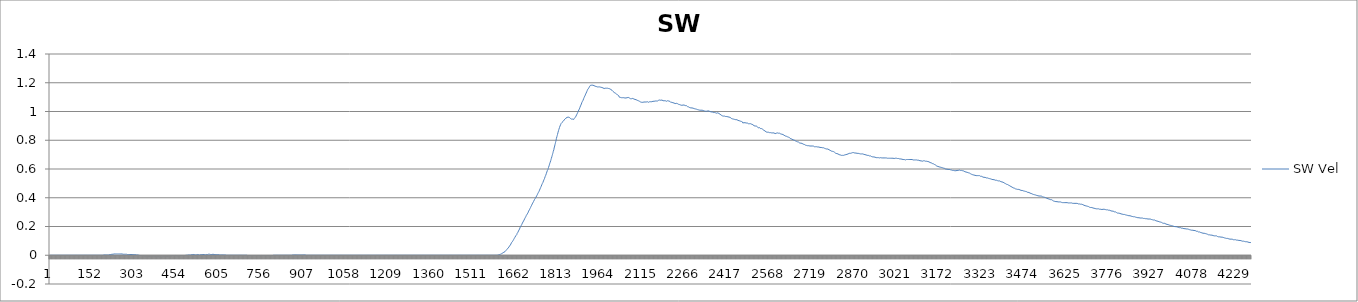
| Category | SW Vel |
|---|---|
| 0 | 0 |
| 1 | 0 |
| 2 | 0 |
| 3 | 0 |
| 4 | 0 |
| 5 | 0 |
| 6 | 0 |
| 7 | 0 |
| 8 | 0 |
| 9 | 0 |
| 10 | 0 |
| 11 | 0 |
| 12 | 0 |
| 13 | 0 |
| 14 | 0 |
| 15 | 0 |
| 16 | 0 |
| 17 | 0 |
| 18 | 0 |
| 19 | 0 |
| 20 | 0 |
| 21 | 0 |
| 22 | 0 |
| 23 | 0 |
| 24 | 0 |
| 25 | 0 |
| 26 | 0 |
| 27 | 0 |
| 28 | 0 |
| 29 | 0 |
| 30 | 0 |
| 31 | 0 |
| 32 | 0 |
| 33 | 0 |
| 34 | 0 |
| 35 | 0 |
| 36 | 0 |
| 37 | 0 |
| 38 | 0 |
| 39 | 0 |
| 40 | 0 |
| 41 | 0 |
| 42 | 0 |
| 43 | 0 |
| 44 | 0 |
| 45 | 0 |
| 46 | 0 |
| 47 | 0 |
| 48 | 0 |
| 49 | 0 |
| 50 | 0 |
| 51 | 0 |
| 52 | 0 |
| 53 | 0 |
| 54 | 0 |
| 55 | 0 |
| 56 | 0 |
| 57 | 0 |
| 58 | 0 |
| 59 | 0 |
| 60 | 0 |
| 61 | 0 |
| 62 | 0 |
| 63 | 0 |
| 64 | 0 |
| 65 | 0 |
| 66 | 0 |
| 67 | 0 |
| 68 | 0 |
| 69 | 0 |
| 70 | 0 |
| 71 | 0 |
| 72 | 0 |
| 73 | 0 |
| 74 | 0 |
| 75 | 0 |
| 76 | 0 |
| 77 | 0 |
| 78 | 0 |
| 79 | 0 |
| 80 | 0 |
| 81 | 0 |
| 82 | 0 |
| 83 | 0 |
| 84 | 0 |
| 85 | 0 |
| 86 | 0 |
| 87 | 0 |
| 88 | 0 |
| 89 | 0 |
| 90 | 0 |
| 91 | 0 |
| 92 | 0 |
| 93 | 0 |
| 94 | 0 |
| 95 | 0 |
| 96 | 0 |
| 97 | 0 |
| 98 | 0 |
| 99 | 0 |
| 100 | 0 |
| 101 | 0 |
| 102 | 0 |
| 103 | 0 |
| 104 | 0 |
| 105 | 0 |
| 106 | 0 |
| 107 | 0 |
| 108 | 0 |
| 109 | 0 |
| 110 | 0 |
| 111 | 0 |
| 112 | 0 |
| 113 | 0 |
| 114 | 0 |
| 115 | 0 |
| 116 | 0 |
| 117 | 0 |
| 118 | 0 |
| 119 | 0 |
| 120 | 0 |
| 121 | 0 |
| 122 | 0 |
| 123 | 0 |
| 124 | 0 |
| 125 | 0 |
| 126 | 0 |
| 127 | 0 |
| 128 | 0 |
| 129 | 0 |
| 130 | 0 |
| 131 | 0 |
| 132 | 0 |
| 133 | 0 |
| 134 | 0 |
| 135 | 0 |
| 136 | 0 |
| 137 | 0 |
| 138 | 0 |
| 139 | 0 |
| 140 | 0 |
| 141 | 0 |
| 142 | 0 |
| 143 | 0 |
| 144 | 0 |
| 145 | 0 |
| 146 | 0 |
| 147 | 0 |
| 148 | 0 |
| 149 | 0 |
| 150 | 0 |
| 151 | 0 |
| 152 | 0 |
| 153 | 0 |
| 154 | 0 |
| 155 | 0 |
| 156 | 0 |
| 157 | 0 |
| 158 | 0 |
| 159 | 0 |
| 160 | 0 |
| 161 | 0 |
| 162 | 0 |
| 163 | 0 |
| 164 | 0 |
| 165 | 0 |
| 166 | 0 |
| 167 | 0 |
| 168 | 0 |
| 169 | 0 |
| 170 | 0 |
| 171 | 0 |
| 172 | 0 |
| 173 | 0 |
| 174 | 0 |
| 175 | 0 |
| 176 | 0 |
| 177 | 0 |
| 178 | 0 |
| 179 | 0 |
| 180 | 0 |
| 181 | 0 |
| 182 | 0 |
| 183 | 0 |
| 184 | 0 |
| 185 | 0 |
| 186 | 0 |
| 187 | 0 |
| 188 | 0 |
| 189 | 0.002 |
| 190 | 0.002 |
| 191 | 0.002 |
| 192 | 0.002 |
| 193 | 0.002 |
| 194 | 0.002 |
| 195 | 0.002 |
| 196 | 0.002 |
| 197 | 0.002 |
| 198 | 0.002 |
| 199 | 0.002 |
| 200 | 0.002 |
| 201 | 0.002 |
| 202 | 0.002 |
| 203 | 0.002 |
| 204 | 0.002 |
| 205 | 0.002 |
| 206 | 0.002 |
| 207 | 0.002 |
| 208 | 0.002 |
| 209 | 0.005 |
| 210 | 0.005 |
| 211 | 0.005 |
| 212 | 0.005 |
| 213 | 0.005 |
| 214 | 0.005 |
| 215 | 0.005 |
| 216 | 0.005 |
| 217 | 0.005 |
| 218 | 0.007 |
| 219 | 0.007 |
| 220 | 0.007 |
| 221 | 0.007 |
| 222 | 0.007 |
| 223 | 0.007 |
| 224 | 0.007 |
| 225 | 0.007 |
| 226 | 0.007 |
| 227 | 0.009 |
| 228 | 0.009 |
| 229 | 0.009 |
| 230 | 0.009 |
| 231 | 0.009 |
| 232 | 0.009 |
| 233 | 0.009 |
| 234 | 0.009 |
| 235 | 0.009 |
| 236 | 0.009 |
| 237 | 0.007 |
| 238 | 0.007 |
| 239 | 0.009 |
| 240 | 0.009 |
| 241 | 0.009 |
| 242 | 0.009 |
| 243 | 0.009 |
| 244 | 0.009 |
| 245 | 0.009 |
| 246 | 0.009 |
| 247 | 0.009 |
| 248 | 0.009 |
| 249 | 0.009 |
| 250 | 0.009 |
| 251 | 0.009 |
| 252 | 0.009 |
| 253 | 0.009 |
| 254 | 0.009 |
| 255 | 0.009 |
| 256 | 0.009 |
| 257 | 0.007 |
| 258 | 0.007 |
| 259 | 0.007 |
| 260 | 0.007 |
| 261 | 0.007 |
| 262 | 0.007 |
| 263 | 0.007 |
| 264 | 0.007 |
| 265 | 0.007 |
| 266 | 0.007 |
| 267 | 0.007 |
| 268 | 0.007 |
| 269 | 0.007 |
| 270 | 0.007 |
| 271 | 0.007 |
| 272 | 0.007 |
| 273 | 0.007 |
| 274 | 0.007 |
| 275 | 0.005 |
| 276 | 0.005 |
| 277 | 0.005 |
| 278 | 0.005 |
| 279 | 0.005 |
| 280 | 0.005 |
| 281 | 0.005 |
| 282 | 0.005 |
| 283 | 0.005 |
| 284 | 0.005 |
| 285 | 0.005 |
| 286 | 0.005 |
| 287 | 0.005 |
| 288 | 0.005 |
| 289 | 0.005 |
| 290 | 0.005 |
| 291 | 0.005 |
| 292 | 0.005 |
| 293 | 0.005 |
| 294 | 0.005 |
| 295 | 0.005 |
| 296 | 0.005 |
| 297 | 0.005 |
| 298 | 0.005 |
| 299 | 0.005 |
| 300 | 0.005 |
| 301 | 0.005 |
| 302 | 0.005 |
| 303 | 0.005 |
| 304 | 0.005 |
| 305 | 0.005 |
| 306 | 0.005 |
| 307 | 0.002 |
| 308 | 0.002 |
| 309 | 0.002 |
| 310 | 0.002 |
| 311 | 0.002 |
| 312 | 0.002 |
| 313 | 0.002 |
| 314 | 0 |
| 315 | 0 |
| 316 | 0 |
| 317 | 0 |
| 318 | 0 |
| 319 | -0.002 |
| 320 | -0.002 |
| 321 | -0.002 |
| 322 | -0.002 |
| 323 | -0.002 |
| 324 | -0.002 |
| 325 | -0.002 |
| 326 | -0.002 |
| 327 | -0.002 |
| 328 | -0.002 |
| 329 | -0.002 |
| 330 | -0.002 |
| 331 | -0.002 |
| 332 | -0.002 |
| 333 | -0.005 |
| 334 | -0.005 |
| 335 | -0.007 |
| 336 | -0.007 |
| 337 | -0.007 |
| 338 | -0.007 |
| 339 | -0.007 |
| 340 | -0.007 |
| 341 | -0.007 |
| 342 | -0.007 |
| 343 | -0.007 |
| 344 | -0.007 |
| 345 | -0.007 |
| 346 | -0.007 |
| 347 | -0.007 |
| 348 | -0.007 |
| 349 | -0.007 |
| 350 | -0.009 |
| 351 | -0.009 |
| 352 | -0.009 |
| 353 | -0.009 |
| 354 | -0.009 |
| 355 | -0.007 |
| 356 | -0.007 |
| 357 | -0.007 |
| 358 | -0.007 |
| 359 | -0.007 |
| 360 | -0.007 |
| 361 | -0.007 |
| 362 | -0.007 |
| 363 | -0.007 |
| 364 | -0.009 |
| 365 | -0.009 |
| 366 | -0.009 |
| 367 | -0.007 |
| 368 | -0.007 |
| 369 | -0.007 |
| 370 | -0.007 |
| 371 | -0.007 |
| 372 | -0.009 |
| 373 | -0.009 |
| 374 | -0.009 |
| 375 | -0.009 |
| 376 | -0.009 |
| 377 | -0.009 |
| 378 | -0.009 |
| 379 | -0.011 |
| 380 | -0.011 |
| 381 | -0.009 |
| 382 | -0.009 |
| 383 | -0.009 |
| 384 | -0.009 |
| 385 | -0.009 |
| 386 | -0.011 |
| 387 | -0.011 |
| 388 | -0.011 |
| 389 | -0.011 |
| 390 | -0.011 |
| 391 | -0.011 |
| 392 | -0.011 |
| 393 | -0.011 |
| 394 | -0.014 |
| 395 | -0.014 |
| 396 | -0.014 |
| 397 | -0.014 |
| 398 | -0.011 |
| 399 | -0.011 |
| 400 | -0.011 |
| 401 | -0.011 |
| 402 | -0.009 |
| 403 | -0.009 |
| 404 | -0.009 |
| 405 | -0.009 |
| 406 | -0.009 |
| 407 | -0.009 |
| 408 | -0.009 |
| 409 | -0.009 |
| 410 | -0.009 |
| 411 | -0.009 |
| 412 | -0.007 |
| 413 | -0.007 |
| 414 | -0.009 |
| 415 | -0.009 |
| 416 | -0.009 |
| 417 | -0.009 |
| 418 | -0.009 |
| 419 | -0.009 |
| 420 | -0.007 |
| 421 | -0.007 |
| 422 | -0.007 |
| 423 | -0.007 |
| 424 | -0.007 |
| 425 | -0.007 |
| 426 | -0.007 |
| 427 | -0.005 |
| 428 | -0.005 |
| 429 | -0.005 |
| 430 | -0.005 |
| 431 | -0.005 |
| 432 | -0.005 |
| 433 | -0.005 |
| 434 | -0.002 |
| 435 | -0.002 |
| 436 | -0.002 |
| 437 | -0.002 |
| 438 | -0.002 |
| 439 | -0.002 |
| 440 | -0.002 |
| 441 | -0.002 |
| 442 | -0.002 |
| 443 | -0.002 |
| 444 | -0.002 |
| 445 | -0.002 |
| 446 | -0.002 |
| 447 | -0.002 |
| 448 | -0.002 |
| 449 | -0.002 |
| 450 | -0.005 |
| 451 | -0.005 |
| 452 | -0.005 |
| 453 | -0.005 |
| 454 | -0.005 |
| 455 | -0.005 |
| 456 | -0.005 |
| 457 | -0.005 |
| 458 | -0.005 |
| 459 | -0.005 |
| 460 | -0.005 |
| 461 | -0.005 |
| 462 | -0.002 |
| 463 | -0.002 |
| 464 | -0.002 |
| 465 | -0.002 |
| 466 | -0.002 |
| 467 | -0.002 |
| 468 | -0.002 |
| 469 | -0.002 |
| 470 | -0.002 |
| 471 | -0.002 |
| 472 | -0.002 |
| 473 | -0.002 |
| 474 | -0.002 |
| 475 | -0.002 |
| 476 | -0.002 |
| 477 | -0.002 |
| 478 | -0.002 |
| 479 | -0.002 |
| 480 | -0.002 |
| 481 | -0.002 |
| 482 | -0.002 |
| 483 | -0.002 |
| 484 | 0 |
| 485 | 0 |
| 486 | 0 |
| 487 | 0 |
| 488 | 0 |
| 489 | 0 |
| 490 | 0.002 |
| 491 | 0.002 |
| 492 | 0.002 |
| 493 | 0.002 |
| 494 | 0.002 |
| 495 | 0.002 |
| 496 | 0.002 |
| 497 | 0.002 |
| 498 | 0.002 |
| 499 | 0.002 |
| 500 | 0.002 |
| 501 | 0.002 |
| 502 | 0.002 |
| 503 | 0.005 |
| 504 | 0.005 |
| 505 | 0.005 |
| 506 | 0.005 |
| 507 | 0.005 |
| 508 | 0.005 |
| 509 | 0.005 |
| 510 | 0.005 |
| 511 | 0.005 |
| 512 | 0.005 |
| 513 | 0.005 |
| 514 | 0.002 |
| 515 | 0.002 |
| 516 | 0.002 |
| 517 | 0.002 |
| 518 | 0.002 |
| 519 | 0.002 |
| 520 | 0.002 |
| 521 | 0.002 |
| 522 | 0.002 |
| 523 | 0.002 |
| 524 | 0.005 |
| 525 | 0.005 |
| 526 | 0.005 |
| 527 | 0.005 |
| 528 | 0.005 |
| 529 | 0.005 |
| 530 | 0.005 |
| 531 | 0.005 |
| 532 | 0.002 |
| 533 | 0.002 |
| 534 | 0.002 |
| 535 | 0.002 |
| 536 | 0.005 |
| 537 | 0.005 |
| 538 | 0.005 |
| 539 | 0.005 |
| 540 | 0.005 |
| 541 | 0.005 |
| 542 | 0.005 |
| 543 | 0.005 |
| 544 | 0.005 |
| 545 | 0.005 |
| 546 | 0.005 |
| 547 | 0.005 |
| 548 | 0.005 |
| 549 | 0.005 |
| 550 | 0.005 |
| 551 | 0.002 |
| 552 | 0.002 |
| 553 | 0.005 |
| 554 | 0.005 |
| 555 | 0.005 |
| 556 | 0.005 |
| 557 | 0.005 |
| 558 | 0.005 |
| 559 | 0.005 |
| 560 | 0.005 |
| 561 | 0.005 |
| 562 | 0.007 |
| 563 | 0.007 |
| 564 | 0.007 |
| 565 | 0.007 |
| 566 | 0.007 |
| 567 | 0.007 |
| 568 | 0.007 |
| 569 | 0.007 |
| 570 | 0.007 |
| 571 | 0.007 |
| 572 | 0.005 |
| 573 | 0.005 |
| 574 | 0.005 |
| 575 | 0.005 |
| 576 | 0.005 |
| 577 | 0.005 |
| 578 | 0.005 |
| 579 | 0.007 |
| 580 | 0.007 |
| 581 | 0.007 |
| 582 | 0.007 |
| 583 | 0.007 |
| 584 | 0.005 |
| 585 | 0.005 |
| 586 | 0.005 |
| 587 | 0.005 |
| 588 | 0.005 |
| 589 | 0.005 |
| 590 | 0.005 |
| 591 | 0.005 |
| 592 | 0.005 |
| 593 | 0.005 |
| 594 | 0.005 |
| 595 | 0.005 |
| 596 | 0.005 |
| 597 | 0.005 |
| 598 | 0.005 |
| 599 | 0.005 |
| 600 | 0.005 |
| 601 | 0.002 |
| 602 | 0.002 |
| 603 | 0.002 |
| 604 | 0.002 |
| 605 | 0.002 |
| 606 | 0.002 |
| 607 | 0.002 |
| 608 | 0.002 |
| 609 | 0.002 |
| 610 | 0.002 |
| 611 | 0.002 |
| 612 | 0.002 |
| 613 | 0.002 |
| 614 | 0.002 |
| 615 | 0.002 |
| 616 | 0.002 |
| 617 | 0.002 |
| 618 | 0.002 |
| 619 | 0.002 |
| 620 | 0.002 |
| 621 | 0.002 |
| 622 | 0.002 |
| 623 | 0.002 |
| 624 | 0.002 |
| 625 | 0.002 |
| 626 | 0.002 |
| 627 | 0 |
| 628 | 0 |
| 629 | 0 |
| 630 | 0 |
| 631 | 0 |
| 632 | 0 |
| 633 | 0 |
| 634 | 0 |
| 635 | 0 |
| 636 | 0 |
| 637 | 0 |
| 638 | 0 |
| 639 | 0 |
| 640 | 0 |
| 641 | 0 |
| 642 | 0 |
| 643 | 0 |
| 644 | 0 |
| 645 | 0 |
| 646 | 0 |
| 647 | 0 |
| 648 | 0 |
| 649 | 0 |
| 650 | 0 |
| 651 | 0 |
| 652 | 0 |
| 653 | 0 |
| 654 | 0 |
| 655 | 0 |
| 656 | 0 |
| 657 | 0 |
| 658 | 0 |
| 659 | 0 |
| 660 | 0 |
| 661 | 0 |
| 662 | 0 |
| 663 | 0 |
| 664 | 0 |
| 665 | 0 |
| 666 | 0 |
| 667 | 0 |
| 668 | 0 |
| 669 | 0 |
| 670 | 0 |
| 671 | 0 |
| 672 | 0 |
| 673 | 0 |
| 674 | 0 |
| 675 | 0 |
| 676 | 0 |
| 677 | 0 |
| 678 | 0 |
| 679 | 0 |
| 680 | 0 |
| 681 | 0 |
| 682 | 0 |
| 683 | 0 |
| 684 | 0 |
| 685 | 0 |
| 686 | 0 |
| 687 | 0 |
| 688 | 0 |
| 689 | 0 |
| 690 | 0 |
| 691 | 0 |
| 692 | 0 |
| 693 | 0 |
| 694 | 0 |
| 695 | 0 |
| 696 | 0 |
| 697 | 0 |
| 698 | 0 |
| 699 | 0 |
| 700 | 0 |
| 701 | -0.002 |
| 702 | -0.002 |
| 703 | -0.002 |
| 704 | -0.002 |
| 705 | -0.002 |
| 706 | -0.002 |
| 707 | -0.002 |
| 708 | -0.002 |
| 709 | -0.002 |
| 710 | -0.002 |
| 711 | -0.002 |
| 712 | -0.002 |
| 713 | -0.002 |
| 714 | -0.002 |
| 715 | -0.002 |
| 716 | -0.002 |
| 717 | -0.002 |
| 718 | -0.002 |
| 719 | -0.002 |
| 720 | -0.002 |
| 721 | -0.002 |
| 722 | -0.002 |
| 723 | -0.002 |
| 724 | -0.002 |
| 725 | -0.002 |
| 726 | -0.002 |
| 727 | -0.002 |
| 728 | -0.002 |
| 729 | -0.002 |
| 730 | -0.002 |
| 731 | -0.002 |
| 732 | -0.002 |
| 733 | -0.002 |
| 734 | -0.002 |
| 735 | -0.002 |
| 736 | -0.002 |
| 737 | -0.002 |
| 738 | -0.002 |
| 739 | -0.002 |
| 740 | -0.002 |
| 741 | -0.002 |
| 742 | -0.002 |
| 743 | -0.002 |
| 744 | -0.002 |
| 745 | -0.002 |
| 746 | -0.005 |
| 747 | -0.005 |
| 748 | -0.005 |
| 749 | -0.002 |
| 750 | -0.002 |
| 751 | -0.002 |
| 752 | -0.002 |
| 753 | -0.002 |
| 754 | -0.002 |
| 755 | -0.002 |
| 756 | -0.002 |
| 757 | -0.002 |
| 758 | -0.002 |
| 759 | -0.002 |
| 760 | -0.002 |
| 761 | -0.002 |
| 762 | -0.002 |
| 763 | -0.002 |
| 764 | -0.002 |
| 765 | -0.002 |
| 766 | -0.002 |
| 767 | -0.002 |
| 768 | -0.002 |
| 769 | -0.002 |
| 770 | -0.002 |
| 771 | -0.002 |
| 772 | -0.002 |
| 773 | -0.002 |
| 774 | -0.002 |
| 775 | -0.002 |
| 776 | -0.002 |
| 777 | -0.002 |
| 778 | -0.002 |
| 779 | -0.002 |
| 780 | -0.002 |
| 781 | -0.002 |
| 782 | -0.002 |
| 783 | -0.002 |
| 784 | -0.002 |
| 785 | -0.002 |
| 786 | -0.002 |
| 787 | -0.002 |
| 788 | -0.002 |
| 789 | -0.002 |
| 790 | -0.002 |
| 791 | -0.002 |
| 792 | -0.002 |
| 793 | -0.002 |
| 794 | 0 |
| 795 | 0 |
| 796 | 0 |
| 797 | 0 |
| 798 | 0 |
| 799 | 0 |
| 800 | 0 |
| 801 | 0 |
| 802 | 0 |
| 803 | 0 |
| 804 | 0 |
| 805 | 0 |
| 806 | 0 |
| 807 | 0 |
| 808 | 0 |
| 809 | 0 |
| 810 | 0 |
| 811 | 0 |
| 812 | 0 |
| 813 | 0 |
| 814 | 0 |
| 815 | 0 |
| 816 | 0 |
| 817 | 0 |
| 818 | 0 |
| 819 | 0 |
| 820 | 0 |
| 821 | 0 |
| 822 | 0 |
| 823 | 0 |
| 824 | 0 |
| 825 | 0 |
| 826 | 0 |
| 827 | 0 |
| 828 | 0 |
| 829 | 0 |
| 830 | 0 |
| 831 | 0 |
| 832 | 0 |
| 833 | 0 |
| 834 | 0 |
| 835 | 0 |
| 836 | 0 |
| 837 | 0 |
| 838 | 0 |
| 839 | 0 |
| 840 | 0 |
| 841 | 0 |
| 842 | 0 |
| 843 | 0 |
| 844 | 0 |
| 845 | 0 |
| 846 | 0 |
| 847 | 0 |
| 848 | 0 |
| 849 | 0 |
| 850 | 0 |
| 851 | 0 |
| 852 | 0 |
| 853 | 0 |
| 854 | 0 |
| 855 | 0 |
| 856 | 0 |
| 857 | 0 |
| 858 | 0 |
| 859 | 0 |
| 860 | 0 |
| 861 | 0.002 |
| 862 | 0.002 |
| 863 | 0.002 |
| 864 | 0.002 |
| 865 | 0.002 |
| 866 | 0.002 |
| 867 | 0.002 |
| 868 | 0.002 |
| 869 | 0.002 |
| 870 | 0.002 |
| 871 | 0.002 |
| 872 | 0.002 |
| 873 | 0.002 |
| 874 | 0.002 |
| 875 | 0.002 |
| 876 | 0.002 |
| 877 | 0.002 |
| 878 | 0.002 |
| 879 | 0.002 |
| 880 | 0.002 |
| 881 | 0.002 |
| 882 | 0.002 |
| 883 | 0.002 |
| 884 | 0.002 |
| 885 | 0.002 |
| 886 | 0.002 |
| 887 | 0.002 |
| 888 | 0.002 |
| 889 | 0.002 |
| 890 | 0.002 |
| 891 | 0.002 |
| 892 | 0.002 |
| 893 | 0.002 |
| 894 | 0.002 |
| 895 | 0.002 |
| 896 | 0.002 |
| 897 | 0.002 |
| 898 | 0.002 |
| 899 | 0.002 |
| 900 | 0.002 |
| 901 | 0.002 |
| 902 | 0.002 |
| 903 | 0.002 |
| 904 | 0.002 |
| 905 | 0.002 |
| 906 | 0.002 |
| 907 | 0.002 |
| 908 | 0.002 |
| 909 | 0 |
| 910 | 0 |
| 911 | 0 |
| 912 | 0 |
| 913 | 0 |
| 914 | 0 |
| 915 | 0 |
| 916 | 0 |
| 917 | 0 |
| 918 | 0 |
| 919 | 0 |
| 920 | 0 |
| 921 | 0 |
| 922 | 0 |
| 923 | 0 |
| 924 | 0 |
| 925 | 0 |
| 926 | 0 |
| 927 | 0 |
| 928 | 0 |
| 929 | 0 |
| 930 | 0 |
| 931 | 0 |
| 932 | 0 |
| 933 | 0 |
| 934 | 0 |
| 935 | 0 |
| 936 | 0 |
| 937 | 0 |
| 938 | 0 |
| 939 | 0 |
| 940 | 0 |
| 941 | 0 |
| 942 | 0 |
| 943 | 0 |
| 944 | 0 |
| 945 | 0 |
| 946 | 0 |
| 947 | 0 |
| 948 | 0 |
| 949 | 0 |
| 950 | 0 |
| 951 | 0 |
| 952 | 0 |
| 953 | 0 |
| 954 | 0 |
| 955 | 0 |
| 956 | 0 |
| 957 | 0 |
| 958 | 0 |
| 959 | 0 |
| 960 | 0 |
| 961 | 0 |
| 962 | 0 |
| 963 | 0 |
| 964 | 0 |
| 965 | 0 |
| 966 | 0 |
| 967 | 0 |
| 968 | 0 |
| 969 | 0 |
| 970 | 0 |
| 971 | 0 |
| 972 | 0 |
| 973 | 0 |
| 974 | 0 |
| 975 | 0 |
| 976 | 0 |
| 977 | 0 |
| 978 | 0 |
| 979 | 0 |
| 980 | 0 |
| 981 | 0 |
| 982 | 0 |
| 983 | 0 |
| 984 | 0 |
| 985 | 0 |
| 986 | 0 |
| 987 | 0 |
| 988 | 0 |
| 989 | 0 |
| 990 | 0 |
| 991 | 0 |
| 992 | 0 |
| 993 | 0 |
| 994 | 0 |
| 995 | 0 |
| 996 | 0 |
| 997 | 0 |
| 998 | 0 |
| 999 | 0 |
| 1000 | 0 |
| 1001 | 0 |
| 1002 | 0 |
| 1003 | 0 |
| 1004 | 0 |
| 1005 | 0 |
| 1006 | 0 |
| 1007 | 0 |
| 1008 | 0 |
| 1009 | 0 |
| 1010 | 0 |
| 1011 | 0 |
| 1012 | 0 |
| 1013 | 0 |
| 1014 | 0 |
| 1015 | 0 |
| 1016 | 0 |
| 1017 | 0 |
| 1018 | 0 |
| 1019 | 0 |
| 1020 | 0 |
| 1021 | 0 |
| 1022 | 0 |
| 1023 | 0 |
| 1024 | 0 |
| 1025 | 0 |
| 1026 | 0 |
| 1027 | 0 |
| 1028 | 0 |
| 1029 | 0 |
| 1030 | 0 |
| 1031 | 0 |
| 1032 | 0 |
| 1033 | 0 |
| 1034 | 0 |
| 1035 | 0 |
| 1036 | 0 |
| 1037 | 0 |
| 1038 | 0 |
| 1039 | 0 |
| 1040 | 0 |
| 1041 | 0 |
| 1042 | 0 |
| 1043 | 0 |
| 1044 | 0 |
| 1045 | 0 |
| 1046 | 0 |
| 1047 | 0 |
| 1048 | 0 |
| 1049 | 0 |
| 1050 | 0 |
| 1051 | 0 |
| 1052 | 0 |
| 1053 | 0 |
| 1054 | 0 |
| 1055 | 0 |
| 1056 | 0 |
| 1057 | 0 |
| 1058 | 0 |
| 1059 | 0 |
| 1060 | 0 |
| 1061 | 0 |
| 1062 | 0 |
| 1063 | 0 |
| 1064 | 0 |
| 1065 | 0 |
| 1066 | 0 |
| 1067 | 0 |
| 1068 | 0 |
| 1069 | 0 |
| 1070 | 0 |
| 1071 | 0 |
| 1072 | 0 |
| 1073 | 0 |
| 1074 | 0 |
| 1075 | 0 |
| 1076 | 0 |
| 1077 | 0 |
| 1078 | 0 |
| 1079 | 0 |
| 1080 | 0 |
| 1081 | 0 |
| 1082 | 0 |
| 1083 | 0 |
| 1084 | 0 |
| 1085 | 0 |
| 1086 | 0 |
| 1087 | 0 |
| 1088 | 0 |
| 1089 | 0 |
| 1090 | 0 |
| 1091 | 0 |
| 1092 | 0 |
| 1093 | 0 |
| 1094 | 0 |
| 1095 | 0 |
| 1096 | 0 |
| 1097 | 0 |
| 1098 | 0 |
| 1099 | 0 |
| 1100 | 0 |
| 1101 | 0 |
| 1102 | 0 |
| 1103 | 0 |
| 1104 | 0 |
| 1105 | 0 |
| 1106 | 0 |
| 1107 | 0 |
| 1108 | 0 |
| 1109 | 0 |
| 1110 | 0 |
| 1111 | 0 |
| 1112 | 0 |
| 1113 | 0 |
| 1114 | 0 |
| 1115 | 0 |
| 1116 | 0 |
| 1117 | 0 |
| 1118 | 0 |
| 1119 | 0 |
| 1120 | 0 |
| 1121 | 0 |
| 1122 | 0 |
| 1123 | 0 |
| 1124 | 0 |
| 1125 | 0 |
| 1126 | 0 |
| 1127 | 0 |
| 1128 | 0 |
| 1129 | 0 |
| 1130 | 0 |
| 1131 | 0 |
| 1132 | 0 |
| 1133 | 0 |
| 1134 | 0 |
| 1135 | 0 |
| 1136 | 0 |
| 1137 | 0 |
| 1138 | 0 |
| 1139 | 0 |
| 1140 | 0 |
| 1141 | 0 |
| 1142 | 0 |
| 1143 | 0 |
| 1144 | 0 |
| 1145 | 0 |
| 1146 | 0 |
| 1147 | 0 |
| 1148 | 0 |
| 1149 | 0 |
| 1150 | 0 |
| 1151 | 0 |
| 1152 | 0 |
| 1153 | 0 |
| 1154 | 0 |
| 1155 | 0 |
| 1156 | 0 |
| 1157 | 0 |
| 1158 | 0 |
| 1159 | 0 |
| 1160 | 0 |
| 1161 | 0 |
| 1162 | 0 |
| 1163 | 0 |
| 1164 | 0 |
| 1165 | 0 |
| 1166 | 0 |
| 1167 | 0 |
| 1168 | 0 |
| 1169 | 0 |
| 1170 | 0 |
| 1171 | 0 |
| 1172 | 0 |
| 1173 | 0 |
| 1174 | 0 |
| 1175 | 0 |
| 1176 | 0 |
| 1177 | 0 |
| 1178 | 0 |
| 1179 | 0 |
| 1180 | 0 |
| 1181 | 0 |
| 1182 | 0 |
| 1183 | 0 |
| 1184 | 0 |
| 1185 | 0 |
| 1186 | 0 |
| 1187 | 0 |
| 1188 | 0 |
| 1189 | 0 |
| 1190 | 0 |
| 1191 | 0 |
| 1192 | 0 |
| 1193 | 0 |
| 1194 | 0 |
| 1195 | 0 |
| 1196 | 0 |
| 1197 | 0 |
| 1198 | 0 |
| 1199 | 0 |
| 1200 | 0 |
| 1201 | 0 |
| 1202 | 0 |
| 1203 | 0 |
| 1204 | 0 |
| 1205 | 0 |
| 1206 | 0 |
| 1207 | 0 |
| 1208 | 0 |
| 1209 | 0 |
| 1210 | 0 |
| 1211 | 0 |
| 1212 | 0 |
| 1213 | 0 |
| 1214 | 0 |
| 1215 | 0 |
| 1216 | 0 |
| 1217 | 0 |
| 1218 | 0 |
| 1219 | 0 |
| 1220 | 0 |
| 1221 | 0 |
| 1222 | 0 |
| 1223 | 0 |
| 1224 | 0 |
| 1225 | 0 |
| 1226 | 0 |
| 1227 | 0 |
| 1228 | 0 |
| 1229 | 0 |
| 1230 | 0 |
| 1231 | 0 |
| 1232 | 0 |
| 1233 | 0 |
| 1234 | 0 |
| 1235 | 0 |
| 1236 | 0 |
| 1237 | 0 |
| 1238 | 0 |
| 1239 | 0 |
| 1240 | 0 |
| 1241 | 0 |
| 1242 | 0 |
| 1243 | 0 |
| 1244 | 0 |
| 1245 | 0 |
| 1246 | 0 |
| 1247 | 0 |
| 1248 | 0 |
| 1249 | 0 |
| 1250 | 0 |
| 1251 | 0 |
| 1252 | 0 |
| 1253 | 0 |
| 1254 | 0 |
| 1255 | 0 |
| 1256 | 0 |
| 1257 | 0 |
| 1258 | 0 |
| 1259 | 0 |
| 1260 | 0 |
| 1261 | 0 |
| 1262 | 0 |
| 1263 | 0 |
| 1264 | 0 |
| 1265 | 0 |
| 1266 | 0 |
| 1267 | 0 |
| 1268 | 0 |
| 1269 | 0 |
| 1270 | 0 |
| 1271 | 0 |
| 1272 | 0 |
| 1273 | 0 |
| 1274 | 0 |
| 1275 | 0 |
| 1276 | 0 |
| 1277 | 0 |
| 1278 | 0 |
| 1279 | 0 |
| 1280 | 0 |
| 1281 | 0 |
| 1282 | 0 |
| 1283 | 0 |
| 1284 | 0 |
| 1285 | 0 |
| 1286 | 0 |
| 1287 | 0 |
| 1288 | 0 |
| 1289 | 0 |
| 1290 | 0 |
| 1291 | 0 |
| 1292 | 0 |
| 1293 | 0 |
| 1294 | 0 |
| 1295 | 0 |
| 1296 | 0 |
| 1297 | 0 |
| 1298 | 0 |
| 1299 | 0 |
| 1300 | 0 |
| 1301 | 0 |
| 1302 | 0 |
| 1303 | 0 |
| 1304 | 0 |
| 1305 | 0 |
| 1306 | 0 |
| 1307 | 0 |
| 1308 | 0 |
| 1309 | 0 |
| 1310 | 0 |
| 1311 | 0 |
| 1312 | 0 |
| 1313 | 0 |
| 1314 | 0 |
| 1315 | 0 |
| 1316 | 0 |
| 1317 | 0 |
| 1318 | 0 |
| 1319 | 0 |
| 1320 | 0 |
| 1321 | 0 |
| 1322 | 0 |
| 1323 | 0 |
| 1324 | 0 |
| 1325 | 0 |
| 1326 | 0 |
| 1327 | 0 |
| 1328 | 0 |
| 1329 | 0 |
| 1330 | 0 |
| 1331 | 0 |
| 1332 | 0 |
| 1333 | 0 |
| 1334 | 0 |
| 1335 | 0 |
| 1336 | 0 |
| 1337 | 0 |
| 1338 | 0 |
| 1339 | 0 |
| 1340 | 0 |
| 1341 | 0 |
| 1342 | 0 |
| 1343 | 0 |
| 1344 | 0 |
| 1345 | 0 |
| 1346 | 0 |
| 1347 | 0 |
| 1348 | 0 |
| 1349 | 0 |
| 1350 | 0 |
| 1351 | 0 |
| 1352 | 0 |
| 1353 | 0 |
| 1354 | 0 |
| 1355 | 0 |
| 1356 | 0 |
| 1357 | 0 |
| 1358 | 0 |
| 1359 | 0 |
| 1360 | 0 |
| 1361 | 0 |
| 1362 | 0 |
| 1363 | 0 |
| 1364 | 0 |
| 1365 | 0 |
| 1366 | 0 |
| 1367 | 0 |
| 1368 | 0 |
| 1369 | 0 |
| 1370 | 0 |
| 1371 | 0 |
| 1372 | 0 |
| 1373 | 0 |
| 1374 | 0 |
| 1375 | 0 |
| 1376 | 0 |
| 1377 | 0 |
| 1378 | 0 |
| 1379 | 0 |
| 1380 | 0 |
| 1381 | 0 |
| 1382 | 0 |
| 1383 | 0 |
| 1384 | 0 |
| 1385 | 0 |
| 1386 | 0 |
| 1387 | 0 |
| 1388 | 0 |
| 1389 | 0 |
| 1390 | 0 |
| 1391 | 0 |
| 1392 | 0 |
| 1393 | 0 |
| 1394 | 0 |
| 1395 | 0 |
| 1396 | 0 |
| 1397 | 0 |
| 1398 | 0 |
| 1399 | 0 |
| 1400 | 0 |
| 1401 | 0 |
| 1402 | 0 |
| 1403 | 0 |
| 1404 | 0 |
| 1405 | 0 |
| 1406 | 0 |
| 1407 | 0 |
| 1408 | 0 |
| 1409 | 0 |
| 1410 | 0 |
| 1411 | 0 |
| 1412 | 0 |
| 1413 | 0 |
| 1414 | 0 |
| 1415 | 0 |
| 1416 | 0 |
| 1417 | 0 |
| 1418 | 0 |
| 1419 | 0 |
| 1420 | 0 |
| 1421 | 0 |
| 1422 | 0 |
| 1423 | 0 |
| 1424 | 0 |
| 1425 | 0 |
| 1426 | 0 |
| 1427 | 0 |
| 1428 | 0 |
| 1429 | 0 |
| 1430 | 0 |
| 1431 | 0 |
| 1432 | 0 |
| 1433 | 0 |
| 1434 | 0 |
| 1435 | 0 |
| 1436 | 0 |
| 1437 | 0 |
| 1438 | 0 |
| 1439 | 0 |
| 1440 | 0 |
| 1441 | 0 |
| 1442 | 0 |
| 1443 | 0 |
| 1444 | 0 |
| 1445 | 0 |
| 1446 | 0 |
| 1447 | 0 |
| 1448 | 0 |
| 1449 | 0 |
| 1450 | 0 |
| 1451 | 0 |
| 1452 | 0 |
| 1453 | 0 |
| 1454 | 0 |
| 1455 | 0 |
| 1456 | 0 |
| 1457 | 0 |
| 1458 | 0 |
| 1459 | 0 |
| 1460 | 0 |
| 1461 | 0 |
| 1462 | 0 |
| 1463 | 0 |
| 1464 | 0 |
| 1465 | 0 |
| 1466 | 0 |
| 1467 | 0 |
| 1468 | 0 |
| 1469 | 0 |
| 1470 | 0 |
| 1471 | 0 |
| 1472 | 0 |
| 1473 | 0 |
| 1474 | 0 |
| 1475 | 0 |
| 1476 | 0 |
| 1477 | 0 |
| 1478 | 0 |
| 1479 | 0 |
| 1480 | 0 |
| 1481 | 0 |
| 1482 | 0 |
| 1483 | 0 |
| 1484 | 0 |
| 1485 | 0 |
| 1486 | 0 |
| 1487 | 0 |
| 1488 | 0 |
| 1489 | 0 |
| 1490 | 0 |
| 1491 | 0 |
| 1492 | 0 |
| 1493 | 0 |
| 1494 | 0 |
| 1495 | 0 |
| 1496 | 0 |
| 1497 | 0 |
| 1498 | 0 |
| 1499 | 0 |
| 1500 | 0 |
| 1501 | 0 |
| 1502 | 0 |
| 1503 | 0 |
| 1504 | 0 |
| 1505 | 0 |
| 1506 | 0 |
| 1507 | 0 |
| 1508 | 0 |
| 1509 | 0 |
| 1510 | 0 |
| 1511 | 0 |
| 1512 | 0 |
| 1513 | 0 |
| 1514 | 0 |
| 1515 | 0 |
| 1516 | 0 |
| 1517 | 0 |
| 1518 | 0 |
| 1519 | 0 |
| 1520 | 0 |
| 1521 | 0 |
| 1522 | 0 |
| 1523 | 0 |
| 1524 | 0 |
| 1525 | 0 |
| 1526 | 0 |
| 1527 | 0 |
| 1528 | 0 |
| 1529 | 0 |
| 1530 | 0 |
| 1531 | 0 |
| 1532 | 0 |
| 1533 | 0 |
| 1534 | 0 |
| 1535 | 0 |
| 1536 | 0 |
| 1537 | 0 |
| 1538 | 0 |
| 1539 | 0 |
| 1540 | 0 |
| 1541 | 0 |
| 1542 | 0 |
| 1543 | 0 |
| 1544 | 0 |
| 1545 | 0 |
| 1546 | 0 |
| 1547 | 0 |
| 1548 | 0 |
| 1549 | 0 |
| 1550 | 0 |
| 1551 | 0 |
| 1552 | 0 |
| 1553 | 0 |
| 1554 | 0 |
| 1555 | 0 |
| 1556 | 0 |
| 1557 | 0 |
| 1558 | 0 |
| 1559 | 0 |
| 1560 | 0 |
| 1561 | 0 |
| 1562 | 0 |
| 1563 | 0 |
| 1564 | 0 |
| 1565 | 0 |
| 1566 | 0 |
| 1567 | 0 |
| 1568 | 0 |
| 1569 | 0 |
| 1570 | 0 |
| 1571 | 0 |
| 1572 | 0 |
| 1573 | 0 |
| 1574 | 0 |
| 1575 | 0 |
| 1576 | 0 |
| 1577 | 0 |
| 1578 | 0 |
| 1579 | 0 |
| 1580 | 0 |
| 1581 | 0 |
| 1582 | 0 |
| 1583 | 0 |
| 1584 | 0 |
| 1585 | 0 |
| 1586 | 0 |
| 1587 | 0 |
| 1588 | 0 |
| 1589 | 0 |
| 1590 | 0 |
| 1591 | 0 |
| 1592 | 0 |
| 1593 | 0 |
| 1594 | 0 |
| 1595 | 0 |
| 1596 | 0.002 |
| 1597 | 0.002 |
| 1598 | 0.002 |
| 1599 | 0.002 |
| 1600 | 0.005 |
| 1601 | 0.005 |
| 1602 | 0.005 |
| 1603 | 0.007 |
| 1604 | 0.007 |
| 1605 | 0.007 |
| 1606 | 0.009 |
| 1607 | 0.009 |
| 1608 | 0.011 |
| 1609 | 0.011 |
| 1610 | 0.014 |
| 1611 | 0.014 |
| 1612 | 0.016 |
| 1613 | 0.016 |
| 1614 | 0.018 |
| 1615 | 0.018 |
| 1616 | 0.021 |
| 1617 | 0.023 |
| 1618 | 0.023 |
| 1619 | 0.025 |
| 1620 | 0.025 |
| 1621 | 0.027 |
| 1622 | 0.03 |
| 1623 | 0.032 |
| 1624 | 0.034 |
| 1625 | 0.034 |
| 1626 | 0.037 |
| 1627 | 0.041 |
| 1628 | 0.041 |
| 1629 | 0.043 |
| 1630 | 0.046 |
| 1631 | 0.05 |
| 1632 | 0.053 |
| 1633 | 0.055 |
| 1634 | 0.057 |
| 1635 | 0.059 |
| 1636 | 0.064 |
| 1637 | 0.066 |
| 1638 | 0.069 |
| 1639 | 0.071 |
| 1640 | 0.075 |
| 1641 | 0.078 |
| 1642 | 0.082 |
| 1643 | 0.087 |
| 1644 | 0.087 |
| 1645 | 0.089 |
| 1646 | 0.094 |
| 1647 | 0.098 |
| 1648 | 0.098 |
| 1649 | 0.103 |
| 1650 | 0.108 |
| 1651 | 0.11 |
| 1652 | 0.112 |
| 1653 | 0.117 |
| 1654 | 0.119 |
| 1655 | 0.124 |
| 1656 | 0.124 |
| 1657 | 0.128 |
| 1658 | 0.13 |
| 1659 | 0.137 |
| 1660 | 0.137 |
| 1661 | 0.142 |
| 1662 | 0.144 |
| 1663 | 0.151 |
| 1664 | 0.153 |
| 1665 | 0.156 |
| 1666 | 0.16 |
| 1667 | 0.165 |
| 1668 | 0.169 |
| 1669 | 0.172 |
| 1670 | 0.176 |
| 1671 | 0.178 |
| 1672 | 0.183 |
| 1673 | 0.19 |
| 1674 | 0.192 |
| 1675 | 0.194 |
| 1676 | 0.201 |
| 1677 | 0.204 |
| 1678 | 0.208 |
| 1679 | 0.21 |
| 1680 | 0.215 |
| 1681 | 0.22 |
| 1682 | 0.224 |
| 1683 | 0.229 |
| 1684 | 0.231 |
| 1685 | 0.233 |
| 1686 | 0.238 |
| 1687 | 0.242 |
| 1688 | 0.245 |
| 1689 | 0.249 |
| 1690 | 0.254 |
| 1691 | 0.256 |
| 1692 | 0.261 |
| 1693 | 0.265 |
| 1694 | 0.268 |
| 1695 | 0.27 |
| 1696 | 0.277 |
| 1697 | 0.279 |
| 1698 | 0.281 |
| 1699 | 0.286 |
| 1700 | 0.291 |
| 1701 | 0.293 |
| 1702 | 0.297 |
| 1703 | 0.3 |
| 1704 | 0.307 |
| 1705 | 0.309 |
| 1706 | 0.313 |
| 1707 | 0.316 |
| 1708 | 0.32 |
| 1709 | 0.325 |
| 1710 | 0.329 |
| 1711 | 0.332 |
| 1712 | 0.336 |
| 1713 | 0.341 |
| 1714 | 0.345 |
| 1715 | 0.348 |
| 1716 | 0.352 |
| 1717 | 0.357 |
| 1718 | 0.359 |
| 1719 | 0.364 |
| 1720 | 0.366 |
| 1721 | 0.368 |
| 1722 | 0.375 |
| 1723 | 0.377 |
| 1724 | 0.38 |
| 1725 | 0.387 |
| 1726 | 0.389 |
| 1727 | 0.391 |
| 1728 | 0.396 |
| 1729 | 0.398 |
| 1730 | 0.403 |
| 1731 | 0.407 |
| 1732 | 0.409 |
| 1733 | 0.414 |
| 1734 | 0.419 |
| 1735 | 0.421 |
| 1736 | 0.426 |
| 1737 | 0.43 |
| 1738 | 0.432 |
| 1739 | 0.437 |
| 1740 | 0.439 |
| 1741 | 0.444 |
| 1742 | 0.448 |
| 1743 | 0.453 |
| 1744 | 0.455 |
| 1745 | 0.462 |
| 1746 | 0.467 |
| 1747 | 0.471 |
| 1748 | 0.474 |
| 1749 | 0.48 |
| 1750 | 0.483 |
| 1751 | 0.49 |
| 1752 | 0.492 |
| 1753 | 0.499 |
| 1754 | 0.503 |
| 1755 | 0.506 |
| 1756 | 0.512 |
| 1757 | 0.517 |
| 1758 | 0.522 |
| 1759 | 0.526 |
| 1760 | 0.531 |
| 1761 | 0.535 |
| 1762 | 0.54 |
| 1763 | 0.547 |
| 1764 | 0.549 |
| 1765 | 0.556 |
| 1766 | 0.56 |
| 1767 | 0.567 |
| 1768 | 0.572 |
| 1769 | 0.579 |
| 1770 | 0.583 |
| 1771 | 0.59 |
| 1772 | 0.593 |
| 1773 | 0.597 |
| 1774 | 0.604 |
| 1775 | 0.611 |
| 1776 | 0.615 |
| 1777 | 0.622 |
| 1778 | 0.629 |
| 1779 | 0.636 |
| 1780 | 0.641 |
| 1781 | 0.647 |
| 1782 | 0.652 |
| 1783 | 0.659 |
| 1784 | 0.666 |
| 1785 | 0.673 |
| 1786 | 0.679 |
| 1787 | 0.686 |
| 1788 | 0.693 |
| 1789 | 0.7 |
| 1790 | 0.707 |
| 1791 | 0.714 |
| 1792 | 0.723 |
| 1793 | 0.727 |
| 1794 | 0.734 |
| 1795 | 0.746 |
| 1796 | 0.753 |
| 1797 | 0.76 |
| 1798 | 0.769 |
| 1799 | 0.776 |
| 1800 | 0.785 |
| 1801 | 0.792 |
| 1802 | 0.801 |
| 1803 | 0.812 |
| 1804 | 0.817 |
| 1805 | 0.826 |
| 1806 | 0.833 |
| 1807 | 0.84 |
| 1808 | 0.846 |
| 1809 | 0.856 |
| 1810 | 0.862 |
| 1811 | 0.869 |
| 1812 | 0.876 |
| 1813 | 0.881 |
| 1814 | 0.888 |
| 1815 | 0.892 |
| 1816 | 0.899 |
| 1817 | 0.904 |
| 1818 | 0.908 |
| 1819 | 0.908 |
| 1820 | 0.917 |
| 1821 | 0.92 |
| 1822 | 0.922 |
| 1823 | 0.924 |
| 1824 | 0.927 |
| 1825 | 0.929 |
| 1826 | 0.929 |
| 1827 | 0.931 |
| 1828 | 0.933 |
| 1829 | 0.936 |
| 1830 | 0.94 |
| 1831 | 0.943 |
| 1832 | 0.943 |
| 1833 | 0.945 |
| 1834 | 0.947 |
| 1835 | 0.949 |
| 1836 | 0.952 |
| 1837 | 0.954 |
| 1838 | 0.956 |
| 1839 | 0.956 |
| 1840 | 0.956 |
| 1841 | 0.959 |
| 1842 | 0.961 |
| 1843 | 0.959 |
| 1844 | 0.961 |
| 1845 | 0.961 |
| 1846 | 0.959 |
| 1847 | 0.959 |
| 1848 | 0.959 |
| 1849 | 0.959 |
| 1850 | 0.956 |
| 1851 | 0.956 |
| 1852 | 0.954 |
| 1853 | 0.952 |
| 1854 | 0.952 |
| 1855 | 0.952 |
| 1856 | 0.949 |
| 1857 | 0.947 |
| 1858 | 0.949 |
| 1859 | 0.947 |
| 1860 | 0.947 |
| 1861 | 0.947 |
| 1862 | 0.945 |
| 1863 | 0.945 |
| 1864 | 0.945 |
| 1865 | 0.945 |
| 1866 | 0.947 |
| 1867 | 0.952 |
| 1868 | 0.952 |
| 1869 | 0.954 |
| 1870 | 0.959 |
| 1871 | 0.961 |
| 1872 | 0.965 |
| 1873 | 0.968 |
| 1874 | 0.972 |
| 1875 | 0.977 |
| 1876 | 0.979 |
| 1877 | 0.984 |
| 1878 | 0.986 |
| 1879 | 0.993 |
| 1880 | 0.997 |
| 1881 | 1.002 |
| 1882 | 1.007 |
| 1883 | 1.011 |
| 1884 | 1.013 |
| 1885 | 1.018 |
| 1886 | 1.023 |
| 1887 | 1.029 |
| 1888 | 1.034 |
| 1889 | 1.039 |
| 1890 | 1.045 |
| 1891 | 1.045 |
| 1892 | 1.052 |
| 1893 | 1.057 |
| 1894 | 1.064 |
| 1895 | 1.066 |
| 1896 | 1.071 |
| 1897 | 1.075 |
| 1898 | 1.078 |
| 1899 | 1.084 |
| 1900 | 1.089 |
| 1901 | 1.094 |
| 1902 | 1.098 |
| 1903 | 1.103 |
| 1904 | 1.107 |
| 1905 | 1.112 |
| 1906 | 1.114 |
| 1907 | 1.121 |
| 1908 | 1.123 |
| 1909 | 1.128 |
| 1910 | 1.132 |
| 1911 | 1.137 |
| 1912 | 1.142 |
| 1913 | 1.146 |
| 1914 | 1.148 |
| 1915 | 1.155 |
| 1916 | 1.158 |
| 1917 | 1.16 |
| 1918 | 1.162 |
| 1919 | 1.167 |
| 1920 | 1.169 |
| 1921 | 1.174 |
| 1922 | 1.176 |
| 1923 | 1.174 |
| 1924 | 1.18 |
| 1925 | 1.183 |
| 1926 | 1.185 |
| 1927 | 1.183 |
| 1928 | 1.185 |
| 1929 | 1.183 |
| 1930 | 1.183 |
| 1931 | 1.183 |
| 1932 | 1.185 |
| 1933 | 1.183 |
| 1934 | 1.183 |
| 1935 | 1.183 |
| 1936 | 1.18 |
| 1937 | 1.18 |
| 1938 | 1.178 |
| 1939 | 1.18 |
| 1940 | 1.176 |
| 1941 | 1.176 |
| 1942 | 1.176 |
| 1943 | 1.176 |
| 1944 | 1.174 |
| 1945 | 1.174 |
| 1946 | 1.176 |
| 1947 | 1.171 |
| 1948 | 1.174 |
| 1949 | 1.171 |
| 1950 | 1.171 |
| 1951 | 1.171 |
| 1952 | 1.171 |
| 1953 | 1.171 |
| 1954 | 1.171 |
| 1955 | 1.171 |
| 1956 | 1.171 |
| 1957 | 1.171 |
| 1958 | 1.171 |
| 1959 | 1.171 |
| 1960 | 1.169 |
| 1961 | 1.169 |
| 1962 | 1.169 |
| 1963 | 1.164 |
| 1964 | 1.164 |
| 1965 | 1.167 |
| 1966 | 1.167 |
| 1967 | 1.164 |
| 1968 | 1.164 |
| 1969 | 1.164 |
| 1970 | 1.162 |
| 1971 | 1.167 |
| 1972 | 1.162 |
| 1973 | 1.16 |
| 1974 | 1.16 |
| 1975 | 1.162 |
| 1976 | 1.162 |
| 1977 | 1.162 |
| 1978 | 1.162 |
| 1979 | 1.164 |
| 1980 | 1.162 |
| 1981 | 1.162 |
| 1982 | 1.162 |
| 1983 | 1.162 |
| 1984 | 1.162 |
| 1985 | 1.162 |
| 1986 | 1.16 |
| 1987 | 1.162 |
| 1988 | 1.162 |
| 1989 | 1.16 |
| 1990 | 1.158 |
| 1991 | 1.158 |
| 1992 | 1.16 |
| 1993 | 1.158 |
| 1994 | 1.155 |
| 1995 | 1.155 |
| 1996 | 1.153 |
| 1997 | 1.153 |
| 1998 | 1.153 |
| 1999 | 1.151 |
| 2000 | 1.151 |
| 2001 | 1.148 |
| 2002 | 1.146 |
| 2003 | 1.144 |
| 2004 | 1.144 |
| 2005 | 1.139 |
| 2006 | 1.139 |
| 2007 | 1.137 |
| 2008 | 1.137 |
| 2009 | 1.132 |
| 2010 | 1.132 |
| 2011 | 1.13 |
| 2012 | 1.13 |
| 2013 | 1.128 |
| 2014 | 1.126 |
| 2015 | 1.126 |
| 2016 | 1.123 |
| 2017 | 1.121 |
| 2018 | 1.121 |
| 2019 | 1.119 |
| 2020 | 1.116 |
| 2021 | 1.116 |
| 2022 | 1.114 |
| 2023 | 1.112 |
| 2024 | 1.11 |
| 2025 | 1.11 |
| 2026 | 1.107 |
| 2027 | 1.1 |
| 2028 | 1.103 |
| 2029 | 1.103 |
| 2030 | 1.1 |
| 2031 | 1.098 |
| 2032 | 1.098 |
| 2033 | 1.096 |
| 2034 | 1.096 |
| 2035 | 1.096 |
| 2036 | 1.094 |
| 2037 | 1.096 |
| 2038 | 1.096 |
| 2039 | 1.096 |
| 2040 | 1.094 |
| 2041 | 1.094 |
| 2042 | 1.094 |
| 2043 | 1.096 |
| 2044 | 1.096 |
| 2045 | 1.096 |
| 2046 | 1.094 |
| 2047 | 1.094 |
| 2048 | 1.094 |
| 2049 | 1.094 |
| 2050 | 1.096 |
| 2051 | 1.094 |
| 2052 | 1.096 |
| 2053 | 1.098 |
| 2054 | 1.096 |
| 2055 | 1.096 |
| 2056 | 1.096 |
| 2057 | 1.098 |
| 2058 | 1.096 |
| 2059 | 1.098 |
| 2060 | 1.096 |
| 2061 | 1.096 |
| 2062 | 1.094 |
| 2063 | 1.094 |
| 2064 | 1.091 |
| 2065 | 1.091 |
| 2066 | 1.091 |
| 2067 | 1.089 |
| 2068 | 1.091 |
| 2069 | 1.089 |
| 2070 | 1.089 |
| 2071 | 1.089 |
| 2072 | 1.089 |
| 2073 | 1.087 |
| 2074 | 1.087 |
| 2075 | 1.091 |
| 2076 | 1.089 |
| 2077 | 1.087 |
| 2078 | 1.087 |
| 2079 | 1.087 |
| 2080 | 1.087 |
| 2081 | 1.087 |
| 2082 | 1.087 |
| 2083 | 1.084 |
| 2084 | 1.084 |
| 2085 | 1.082 |
| 2086 | 1.082 |
| 2087 | 1.082 |
| 2088 | 1.082 |
| 2089 | 1.082 |
| 2090 | 1.082 |
| 2091 | 1.078 |
| 2092 | 1.078 |
| 2093 | 1.078 |
| 2094 | 1.075 |
| 2095 | 1.075 |
| 2096 | 1.073 |
| 2097 | 1.073 |
| 2098 | 1.071 |
| 2099 | 1.071 |
| 2100 | 1.066 |
| 2101 | 1.066 |
| 2102 | 1.066 |
| 2103 | 1.066 |
| 2104 | 1.064 |
| 2105 | 1.064 |
| 2106 | 1.064 |
| 2107 | 1.064 |
| 2108 | 1.064 |
| 2109 | 1.061 |
| 2110 | 1.064 |
| 2111 | 1.064 |
| 2112 | 1.064 |
| 2113 | 1.064 |
| 2114 | 1.064 |
| 2115 | 1.066 |
| 2116 | 1.064 |
| 2117 | 1.066 |
| 2118 | 1.066 |
| 2119 | 1.066 |
| 2120 | 1.066 |
| 2121 | 1.068 |
| 2122 | 1.071 |
| 2123 | 1.066 |
| 2124 | 1.068 |
| 2125 | 1.071 |
| 2126 | 1.071 |
| 2127 | 1.068 |
| 2128 | 1.068 |
| 2129 | 1.068 |
| 2130 | 1.066 |
| 2131 | 1.064 |
| 2132 | 1.068 |
| 2133 | 1.068 |
| 2134 | 1.068 |
| 2135 | 1.068 |
| 2136 | 1.066 |
| 2137 | 1.066 |
| 2138 | 1.066 |
| 2139 | 1.068 |
| 2140 | 1.068 |
| 2141 | 1.066 |
| 2142 | 1.068 |
| 2143 | 1.068 |
| 2144 | 1.068 |
| 2145 | 1.068 |
| 2146 | 1.068 |
| 2147 | 1.071 |
| 2148 | 1.071 |
| 2149 | 1.071 |
| 2150 | 1.071 |
| 2151 | 1.071 |
| 2152 | 1.073 |
| 2153 | 1.071 |
| 2154 | 1.071 |
| 2155 | 1.073 |
| 2156 | 1.071 |
| 2157 | 1.073 |
| 2158 | 1.073 |
| 2159 | 1.073 |
| 2160 | 1.075 |
| 2161 | 1.075 |
| 2162 | 1.078 |
| 2163 | 1.073 |
| 2164 | 1.078 |
| 2165 | 1.078 |
| 2166 | 1.078 |
| 2167 | 1.078 |
| 2168 | 1.078 |
| 2169 | 1.078 |
| 2170 | 1.073 |
| 2171 | 1.08 |
| 2172 | 1.078 |
| 2173 | 1.078 |
| 2174 | 1.075 |
| 2175 | 1.078 |
| 2176 | 1.078 |
| 2177 | 1.078 |
| 2178 | 1.08 |
| 2179 | 1.08 |
| 2180 | 1.075 |
| 2181 | 1.075 |
| 2182 | 1.075 |
| 2183 | 1.075 |
| 2184 | 1.075 |
| 2185 | 1.075 |
| 2186 | 1.075 |
| 2187 | 1.075 |
| 2188 | 1.073 |
| 2189 | 1.075 |
| 2190 | 1.075 |
| 2191 | 1.075 |
| 2192 | 1.075 |
| 2193 | 1.075 |
| 2194 | 1.075 |
| 2195 | 1.071 |
| 2196 | 1.075 |
| 2197 | 1.073 |
| 2198 | 1.075 |
| 2199 | 1.075 |
| 2200 | 1.073 |
| 2201 | 1.075 |
| 2202 | 1.075 |
| 2203 | 1.073 |
| 2204 | 1.073 |
| 2205 | 1.073 |
| 2206 | 1.071 |
| 2207 | 1.071 |
| 2208 | 1.068 |
| 2209 | 1.068 |
| 2210 | 1.064 |
| 2211 | 1.068 |
| 2212 | 1.064 |
| 2213 | 1.064 |
| 2214 | 1.064 |
| 2215 | 1.061 |
| 2216 | 1.061 |
| 2217 | 1.061 |
| 2218 | 1.061 |
| 2219 | 1.055 |
| 2220 | 1.057 |
| 2221 | 1.057 |
| 2222 | 1.059 |
| 2223 | 1.057 |
| 2224 | 1.057 |
| 2225 | 1.057 |
| 2226 | 1.055 |
| 2227 | 1.059 |
| 2228 | 1.059 |
| 2229 | 1.059 |
| 2230 | 1.057 |
| 2231 | 1.057 |
| 2232 | 1.057 |
| 2233 | 1.055 |
| 2234 | 1.055 |
| 2235 | 1.052 |
| 2236 | 1.055 |
| 2237 | 1.052 |
| 2238 | 1.05 |
| 2239 | 1.05 |
| 2240 | 1.05 |
| 2241 | 1.048 |
| 2242 | 1.048 |
| 2243 | 1.05 |
| 2244 | 1.048 |
| 2245 | 1.048 |
| 2246 | 1.045 |
| 2247 | 1.045 |
| 2248 | 1.045 |
| 2249 | 1.045 |
| 2250 | 1.043 |
| 2251 | 1.045 |
| 2252 | 1.045 |
| 2253 | 1.043 |
| 2254 | 1.045 |
| 2255 | 1.043 |
| 2256 | 1.045 |
| 2257 | 1.043 |
| 2258 | 1.045 |
| 2259 | 1.043 |
| 2260 | 1.043 |
| 2261 | 1.041 |
| 2262 | 1.041 |
| 2263 | 1.041 |
| 2264 | 1.041 |
| 2265 | 1.039 |
| 2266 | 1.041 |
| 2267 | 1.043 |
| 2268 | 1.039 |
| 2269 | 1.039 |
| 2270 | 1.034 |
| 2271 | 1.036 |
| 2272 | 1.034 |
| 2273 | 1.032 |
| 2274 | 1.032 |
| 2275 | 1.029 |
| 2276 | 1.029 |
| 2277 | 1.027 |
| 2278 | 1.027 |
| 2279 | 1.025 |
| 2280 | 1.025 |
| 2281 | 1.027 |
| 2282 | 1.025 |
| 2283 | 1.025 |
| 2284 | 1.023 |
| 2285 | 1.025 |
| 2286 | 1.025 |
| 2287 | 1.023 |
| 2288 | 1.023 |
| 2289 | 1.023 |
| 2290 | 1.023 |
| 2291 | 1.023 |
| 2292 | 1.02 |
| 2293 | 1.02 |
| 2294 | 1.02 |
| 2295 | 1.018 |
| 2296 | 1.018 |
| 2297 | 1.016 |
| 2298 | 1.018 |
| 2299 | 1.016 |
| 2300 | 1.016 |
| 2301 | 1.018 |
| 2302 | 1.016 |
| 2303 | 1.016 |
| 2304 | 1.013 |
| 2305 | 1.016 |
| 2306 | 1.013 |
| 2307 | 1.013 |
| 2308 | 1.013 |
| 2309 | 1.013 |
| 2310 | 1.011 |
| 2311 | 1.013 |
| 2312 | 1.011 |
| 2313 | 1.011 |
| 2314 | 1.009 |
| 2315 | 1.004 |
| 2316 | 1.009 |
| 2317 | 1.007 |
| 2318 | 1.009 |
| 2319 | 1.007 |
| 2320 | 1.007 |
| 2321 | 1.007 |
| 2322 | 1.009 |
| 2323 | 1.007 |
| 2324 | 1.007 |
| 2325 | 1.007 |
| 2326 | 1.007 |
| 2327 | 1.007 |
| 2328 | 1.007 |
| 2329 | 1.004 |
| 2330 | 1.004 |
| 2331 | 1.004 |
| 2332 | 1.004 |
| 2333 | 1.002 |
| 2334 | 1.002 |
| 2335 | 1.004 |
| 2336 | 1.004 |
| 2337 | 1.004 |
| 2338 | 1.002 |
| 2339 | 1 |
| 2340 | 1.002 |
| 2341 | 1.004 |
| 2342 | 1.004 |
| 2343 | 1.004 |
| 2344 | 1.004 |
| 2345 | 1.004 |
| 2346 | 1.004 |
| 2347 | 1.004 |
| 2348 | 1.004 |
| 2349 | 1 |
| 2350 | 1 |
| 2351 | 1 |
| 2352 | 1 |
| 2353 | 0.997 |
| 2354 | 0.997 |
| 2355 | 0.997 |
| 2356 | 0.997 |
| 2357 | 0.997 |
| 2358 | 0.997 |
| 2359 | 0.995 |
| 2360 | 0.993 |
| 2361 | 0.993 |
| 2362 | 0.993 |
| 2363 | 0.997 |
| 2364 | 0.993 |
| 2365 | 0.993 |
| 2366 | 0.993 |
| 2367 | 0.993 |
| 2368 | 0.991 |
| 2369 | 0.991 |
| 2370 | 0.991 |
| 2371 | 0.988 |
| 2372 | 0.988 |
| 2373 | 0.988 |
| 2374 | 0.988 |
| 2375 | 0.991 |
| 2376 | 0.988 |
| 2377 | 0.988 |
| 2378 | 0.991 |
| 2379 | 0.986 |
| 2380 | 0.988 |
| 2381 | 0.986 |
| 2382 | 0.986 |
| 2383 | 0.984 |
| 2384 | 0.984 |
| 2385 | 0.981 |
| 2386 | 0.981 |
| 2387 | 0.984 |
| 2388 | 0.979 |
| 2389 | 0.977 |
| 2390 | 0.975 |
| 2391 | 0.975 |
| 2392 | 0.975 |
| 2393 | 0.972 |
| 2394 | 0.97 |
| 2395 | 0.97 |
| 2396 | 0.968 |
| 2397 | 0.97 |
| 2398 | 0.968 |
| 2399 | 0.968 |
| 2400 | 0.968 |
| 2401 | 0.965 |
| 2402 | 0.968 |
| 2403 | 0.965 |
| 2404 | 0.965 |
| 2405 | 0.965 |
| 2406 | 0.965 |
| 2407 | 0.963 |
| 2408 | 0.965 |
| 2409 | 0.965 |
| 2410 | 0.965 |
| 2411 | 0.965 |
| 2412 | 0.965 |
| 2413 | 0.963 |
| 2414 | 0.963 |
| 2415 | 0.963 |
| 2416 | 0.965 |
| 2417 | 0.963 |
| 2418 | 0.961 |
| 2419 | 0.963 |
| 2420 | 0.961 |
| 2421 | 0.961 |
| 2422 | 0.959 |
| 2423 | 0.954 |
| 2424 | 0.956 |
| 2425 | 0.954 |
| 2426 | 0.952 |
| 2427 | 0.954 |
| 2428 | 0.949 |
| 2429 | 0.949 |
| 2430 | 0.949 |
| 2431 | 0.947 |
| 2432 | 0.947 |
| 2433 | 0.947 |
| 2434 | 0.947 |
| 2435 | 0.945 |
| 2436 | 0.947 |
| 2437 | 0.945 |
| 2438 | 0.945 |
| 2439 | 0.945 |
| 2440 | 0.943 |
| 2441 | 0.943 |
| 2442 | 0.943 |
| 2443 | 0.943 |
| 2444 | 0.943 |
| 2445 | 0.94 |
| 2446 | 0.943 |
| 2447 | 0.94 |
| 2448 | 0.94 |
| 2449 | 0.94 |
| 2450 | 0.938 |
| 2451 | 0.94 |
| 2452 | 0.938 |
| 2453 | 0.938 |
| 2454 | 0.936 |
| 2455 | 0.938 |
| 2456 | 0.936 |
| 2457 | 0.936 |
| 2458 | 0.933 |
| 2459 | 0.933 |
| 2460 | 0.931 |
| 2461 | 0.931 |
| 2462 | 0.931 |
| 2463 | 0.929 |
| 2464 | 0.927 |
| 2465 | 0.927 |
| 2466 | 0.927 |
| 2467 | 0.92 |
| 2468 | 0.924 |
| 2469 | 0.922 |
| 2470 | 0.922 |
| 2471 | 0.922 |
| 2472 | 0.922 |
| 2473 | 0.922 |
| 2474 | 0.92 |
| 2475 | 0.922 |
| 2476 | 0.92 |
| 2477 | 0.922 |
| 2478 | 0.92 |
| 2479 | 0.92 |
| 2480 | 0.92 |
| 2481 | 0.92 |
| 2482 | 0.92 |
| 2483 | 0.92 |
| 2484 | 0.917 |
| 2485 | 0.917 |
| 2486 | 0.917 |
| 2487 | 0.915 |
| 2488 | 0.917 |
| 2489 | 0.917 |
| 2490 | 0.915 |
| 2491 | 0.915 |
| 2492 | 0.915 |
| 2493 | 0.915 |
| 2494 | 0.915 |
| 2495 | 0.915 |
| 2496 | 0.913 |
| 2497 | 0.913 |
| 2498 | 0.913 |
| 2499 | 0.911 |
| 2500 | 0.911 |
| 2501 | 0.911 |
| 2502 | 0.911 |
| 2503 | 0.908 |
| 2504 | 0.906 |
| 2505 | 0.904 |
| 2506 | 0.906 |
| 2507 | 0.901 |
| 2508 | 0.901 |
| 2509 | 0.901 |
| 2510 | 0.899 |
| 2511 | 0.899 |
| 2512 | 0.899 |
| 2513 | 0.897 |
| 2514 | 0.897 |
| 2515 | 0.899 |
| 2516 | 0.894 |
| 2517 | 0.894 |
| 2518 | 0.894 |
| 2519 | 0.894 |
| 2520 | 0.892 |
| 2521 | 0.892 |
| 2522 | 0.892 |
| 2523 | 0.885 |
| 2524 | 0.89 |
| 2525 | 0.888 |
| 2526 | 0.888 |
| 2527 | 0.888 |
| 2528 | 0.883 |
| 2529 | 0.883 |
| 2530 | 0.881 |
| 2531 | 0.881 |
| 2532 | 0.881 |
| 2533 | 0.881 |
| 2534 | 0.881 |
| 2535 | 0.881 |
| 2536 | 0.876 |
| 2537 | 0.876 |
| 2538 | 0.876 |
| 2539 | 0.874 |
| 2540 | 0.874 |
| 2541 | 0.874 |
| 2542 | 0.869 |
| 2543 | 0.869 |
| 2544 | 0.869 |
| 2545 | 0.867 |
| 2546 | 0.865 |
| 2547 | 0.865 |
| 2548 | 0.862 |
| 2549 | 0.86 |
| 2550 | 0.858 |
| 2551 | 0.858 |
| 2552 | 0.86 |
| 2553 | 0.858 |
| 2554 | 0.856 |
| 2555 | 0.858 |
| 2556 | 0.856 |
| 2557 | 0.856 |
| 2558 | 0.856 |
| 2559 | 0.856 |
| 2560 | 0.853 |
| 2561 | 0.856 |
| 2562 | 0.853 |
| 2563 | 0.856 |
| 2564 | 0.856 |
| 2565 | 0.853 |
| 2566 | 0.853 |
| 2567 | 0.853 |
| 2568 | 0.853 |
| 2569 | 0.851 |
| 2570 | 0.851 |
| 2571 | 0.856 |
| 2572 | 0.851 |
| 2573 | 0.851 |
| 2574 | 0.851 |
| 2575 | 0.849 |
| 2576 | 0.851 |
| 2577 | 0.851 |
| 2578 | 0.851 |
| 2579 | 0.849 |
| 2580 | 0.849 |
| 2581 | 0.849 |
| 2582 | 0.846 |
| 2583 | 0.846 |
| 2584 | 0.849 |
| 2585 | 0.849 |
| 2586 | 0.849 |
| 2587 | 0.849 |
| 2588 | 0.849 |
| 2589 | 0.849 |
| 2590 | 0.851 |
| 2591 | 0.849 |
| 2592 | 0.849 |
| 2593 | 0.849 |
| 2594 | 0.849 |
| 2595 | 0.846 |
| 2596 | 0.849 |
| 2597 | 0.846 |
| 2598 | 0.849 |
| 2599 | 0.846 |
| 2600 | 0.844 |
| 2601 | 0.844 |
| 2602 | 0.844 |
| 2603 | 0.842 |
| 2604 | 0.844 |
| 2605 | 0.842 |
| 2606 | 0.842 |
| 2607 | 0.84 |
| 2608 | 0.842 |
| 2609 | 0.84 |
| 2610 | 0.84 |
| 2611 | 0.837 |
| 2612 | 0.835 |
| 2613 | 0.837 |
| 2614 | 0.835 |
| 2615 | 0.833 |
| 2616 | 0.833 |
| 2617 | 0.833 |
| 2618 | 0.83 |
| 2619 | 0.828 |
| 2620 | 0.83 |
| 2621 | 0.828 |
| 2622 | 0.828 |
| 2623 | 0.828 |
| 2624 | 0.826 |
| 2625 | 0.826 |
| 2626 | 0.824 |
| 2627 | 0.824 |
| 2628 | 0.824 |
| 2629 | 0.821 |
| 2630 | 0.821 |
| 2631 | 0.821 |
| 2632 | 0.819 |
| 2633 | 0.817 |
| 2634 | 0.817 |
| 2635 | 0.812 |
| 2636 | 0.814 |
| 2637 | 0.812 |
| 2638 | 0.81 |
| 2639 | 0.81 |
| 2640 | 0.808 |
| 2641 | 0.81 |
| 2642 | 0.808 |
| 2643 | 0.808 |
| 2644 | 0.805 |
| 2645 | 0.805 |
| 2646 | 0.803 |
| 2647 | 0.803 |
| 2648 | 0.803 |
| 2649 | 0.803 |
| 2650 | 0.801 |
| 2651 | 0.801 |
| 2652 | 0.798 |
| 2653 | 0.798 |
| 2654 | 0.796 |
| 2655 | 0.796 |
| 2656 | 0.794 |
| 2657 | 0.794 |
| 2658 | 0.792 |
| 2659 | 0.792 |
| 2660 | 0.792 |
| 2661 | 0.789 |
| 2662 | 0.789 |
| 2663 | 0.789 |
| 2664 | 0.787 |
| 2665 | 0.787 |
| 2666 | 0.787 |
| 2667 | 0.787 |
| 2668 | 0.785 |
| 2669 | 0.785 |
| 2670 | 0.78 |
| 2671 | 0.782 |
| 2672 | 0.782 |
| 2673 | 0.778 |
| 2674 | 0.78 |
| 2675 | 0.778 |
| 2676 | 0.778 |
| 2677 | 0.778 |
| 2678 | 0.778 |
| 2679 | 0.776 |
| 2680 | 0.776 |
| 2681 | 0.776 |
| 2682 | 0.773 |
| 2683 | 0.771 |
| 2684 | 0.771 |
| 2685 | 0.771 |
| 2686 | 0.771 |
| 2687 | 0.769 |
| 2688 | 0.769 |
| 2689 | 0.766 |
| 2690 | 0.766 |
| 2691 | 0.764 |
| 2692 | 0.764 |
| 2693 | 0.764 |
| 2694 | 0.764 |
| 2695 | 0.762 |
| 2696 | 0.762 |
| 2697 | 0.762 |
| 2698 | 0.762 |
| 2699 | 0.762 |
| 2700 | 0.762 |
| 2701 | 0.762 |
| 2702 | 0.762 |
| 2703 | 0.762 |
| 2704 | 0.76 |
| 2705 | 0.76 |
| 2706 | 0.76 |
| 2707 | 0.76 |
| 2708 | 0.76 |
| 2709 | 0.76 |
| 2710 | 0.76 |
| 2711 | 0.76 |
| 2712 | 0.76 |
| 2713 | 0.757 |
| 2714 | 0.76 |
| 2715 | 0.757 |
| 2716 | 0.757 |
| 2717 | 0.757 |
| 2718 | 0.76 |
| 2719 | 0.757 |
| 2720 | 0.755 |
| 2721 | 0.757 |
| 2722 | 0.755 |
| 2723 | 0.757 |
| 2724 | 0.755 |
| 2725 | 0.755 |
| 2726 | 0.755 |
| 2727 | 0.755 |
| 2728 | 0.755 |
| 2729 | 0.753 |
| 2730 | 0.755 |
| 2731 | 0.755 |
| 2732 | 0.753 |
| 2733 | 0.753 |
| 2734 | 0.753 |
| 2735 | 0.753 |
| 2736 | 0.753 |
| 2737 | 0.753 |
| 2738 | 0.753 |
| 2739 | 0.753 |
| 2740 | 0.753 |
| 2741 | 0.75 |
| 2742 | 0.75 |
| 2743 | 0.753 |
| 2744 | 0.75 |
| 2745 | 0.75 |
| 2746 | 0.75 |
| 2747 | 0.748 |
| 2748 | 0.748 |
| 2749 | 0.748 |
| 2750 | 0.748 |
| 2751 | 0.746 |
| 2752 | 0.748 |
| 2753 | 0.748 |
| 2754 | 0.748 |
| 2755 | 0.746 |
| 2756 | 0.746 |
| 2757 | 0.746 |
| 2758 | 0.744 |
| 2759 | 0.744 |
| 2760 | 0.744 |
| 2761 | 0.744 |
| 2762 | 0.741 |
| 2763 | 0.741 |
| 2764 | 0.741 |
| 2765 | 0.741 |
| 2766 | 0.739 |
| 2767 | 0.739 |
| 2768 | 0.741 |
| 2769 | 0.739 |
| 2770 | 0.739 |
| 2771 | 0.737 |
| 2772 | 0.737 |
| 2773 | 0.734 |
| 2774 | 0.734 |
| 2775 | 0.732 |
| 2776 | 0.732 |
| 2777 | 0.732 |
| 2778 | 0.73 |
| 2779 | 0.732 |
| 2780 | 0.73 |
| 2781 | 0.727 |
| 2782 | 0.725 |
| 2783 | 0.727 |
| 2784 | 0.725 |
| 2785 | 0.725 |
| 2786 | 0.723 |
| 2787 | 0.723 |
| 2788 | 0.723 |
| 2789 | 0.723 |
| 2790 | 0.721 |
| 2791 | 0.718 |
| 2792 | 0.721 |
| 2793 | 0.718 |
| 2794 | 0.716 |
| 2795 | 0.716 |
| 2796 | 0.714 |
| 2797 | 0.711 |
| 2798 | 0.709 |
| 2799 | 0.711 |
| 2800 | 0.709 |
| 2801 | 0.707 |
| 2802 | 0.707 |
| 2803 | 0.705 |
| 2804 | 0.705 |
| 2805 | 0.702 |
| 2806 | 0.705 |
| 2807 | 0.702 |
| 2808 | 0.7 |
| 2809 | 0.702 |
| 2810 | 0.7 |
| 2811 | 0.7 |
| 2812 | 0.698 |
| 2813 | 0.698 |
| 2814 | 0.698 |
| 2815 | 0.698 |
| 2816 | 0.695 |
| 2817 | 0.695 |
| 2818 | 0.695 |
| 2819 | 0.695 |
| 2820 | 0.695 |
| 2821 | 0.695 |
| 2822 | 0.695 |
| 2823 | 0.695 |
| 2824 | 0.695 |
| 2825 | 0.695 |
| 2826 | 0.695 |
| 2827 | 0.695 |
| 2828 | 0.695 |
| 2829 | 0.698 |
| 2830 | 0.698 |
| 2831 | 0.698 |
| 2832 | 0.698 |
| 2833 | 0.698 |
| 2834 | 0.7 |
| 2835 | 0.7 |
| 2836 | 0.7 |
| 2837 | 0.7 |
| 2838 | 0.702 |
| 2839 | 0.702 |
| 2840 | 0.702 |
| 2841 | 0.705 |
| 2842 | 0.705 |
| 2843 | 0.707 |
| 2844 | 0.707 |
| 2845 | 0.709 |
| 2846 | 0.709 |
| 2847 | 0.709 |
| 2848 | 0.709 |
| 2849 | 0.711 |
| 2850 | 0.709 |
| 2851 | 0.711 |
| 2852 | 0.711 |
| 2853 | 0.711 |
| 2854 | 0.711 |
| 2855 | 0.711 |
| 2856 | 0.711 |
| 2857 | 0.711 |
| 2858 | 0.714 |
| 2859 | 0.714 |
| 2860 | 0.714 |
| 2861 | 0.714 |
| 2862 | 0.714 |
| 2863 | 0.711 |
| 2864 | 0.714 |
| 2865 | 0.714 |
| 2866 | 0.711 |
| 2867 | 0.711 |
| 2868 | 0.711 |
| 2869 | 0.711 |
| 2870 | 0.711 |
| 2871 | 0.711 |
| 2872 | 0.709 |
| 2873 | 0.711 |
| 2874 | 0.709 |
| 2875 | 0.709 |
| 2876 | 0.709 |
| 2877 | 0.707 |
| 2878 | 0.709 |
| 2879 | 0.707 |
| 2880 | 0.709 |
| 2881 | 0.707 |
| 2882 | 0.707 |
| 2883 | 0.707 |
| 2884 | 0.705 |
| 2885 | 0.707 |
| 2886 | 0.705 |
| 2887 | 0.707 |
| 2888 | 0.705 |
| 2889 | 0.705 |
| 2890 | 0.705 |
| 2891 | 0.702 |
| 2892 | 0.705 |
| 2893 | 0.702 |
| 2894 | 0.705 |
| 2895 | 0.702 |
| 2896 | 0.702 |
| 2897 | 0.7 |
| 2898 | 0.702 |
| 2899 | 0.702 |
| 2900 | 0.7 |
| 2901 | 0.7 |
| 2902 | 0.7 |
| 2903 | 0.7 |
| 2904 | 0.7 |
| 2905 | 0.698 |
| 2906 | 0.698 |
| 2907 | 0.698 |
| 2908 | 0.698 |
| 2909 | 0.695 |
| 2910 | 0.695 |
| 2911 | 0.695 |
| 2912 | 0.695 |
| 2913 | 0.695 |
| 2914 | 0.695 |
| 2915 | 0.695 |
| 2916 | 0.693 |
| 2917 | 0.693 |
| 2918 | 0.691 |
| 2919 | 0.691 |
| 2920 | 0.691 |
| 2921 | 0.689 |
| 2922 | 0.691 |
| 2923 | 0.686 |
| 2924 | 0.689 |
| 2925 | 0.689 |
| 2926 | 0.686 |
| 2927 | 0.686 |
| 2928 | 0.684 |
| 2929 | 0.684 |
| 2930 | 0.684 |
| 2931 | 0.684 |
| 2932 | 0.684 |
| 2933 | 0.682 |
| 2934 | 0.684 |
| 2935 | 0.682 |
| 2936 | 0.682 |
| 2937 | 0.682 |
| 2938 | 0.682 |
| 2939 | 0.682 |
| 2940 | 0.679 |
| 2941 | 0.682 |
| 2942 | 0.679 |
| 2943 | 0.679 |
| 2944 | 0.682 |
| 2945 | 0.682 |
| 2946 | 0.679 |
| 2947 | 0.679 |
| 2948 | 0.679 |
| 2949 | 0.682 |
| 2950 | 0.679 |
| 2951 | 0.679 |
| 2952 | 0.679 |
| 2953 | 0.679 |
| 2954 | 0.677 |
| 2955 | 0.677 |
| 2956 | 0.679 |
| 2957 | 0.679 |
| 2958 | 0.679 |
| 2959 | 0.679 |
| 2960 | 0.677 |
| 2961 | 0.677 |
| 2962 | 0.677 |
| 2963 | 0.677 |
| 2964 | 0.677 |
| 2965 | 0.677 |
| 2966 | 0.677 |
| 2967 | 0.677 |
| 2968 | 0.677 |
| 2969 | 0.677 |
| 2970 | 0.677 |
| 2971 | 0.679 |
| 2972 | 0.677 |
| 2973 | 0.677 |
| 2974 | 0.677 |
| 2975 | 0.677 |
| 2976 | 0.677 |
| 2977 | 0.677 |
| 2978 | 0.677 |
| 2979 | 0.677 |
| 2980 | 0.677 |
| 2981 | 0.677 |
| 2982 | 0.675 |
| 2983 | 0.677 |
| 2984 | 0.677 |
| 2985 | 0.675 |
| 2986 | 0.675 |
| 2987 | 0.675 |
| 2988 | 0.675 |
| 2989 | 0.675 |
| 2990 | 0.675 |
| 2991 | 0.675 |
| 2992 | 0.673 |
| 2993 | 0.673 |
| 2994 | 0.675 |
| 2995 | 0.675 |
| 2996 | 0.675 |
| 2997 | 0.673 |
| 2998 | 0.675 |
| 2999 | 0.675 |
| 3000 | 0.675 |
| 3001 | 0.675 |
| 3002 | 0.675 |
| 3003 | 0.675 |
| 3004 | 0.673 |
| 3005 | 0.675 |
| 3006 | 0.673 |
| 3007 | 0.675 |
| 3008 | 0.675 |
| 3009 | 0.675 |
| 3010 | 0.675 |
| 3011 | 0.675 |
| 3012 | 0.675 |
| 3013 | 0.675 |
| 3014 | 0.675 |
| 3015 | 0.675 |
| 3016 | 0.675 |
| 3017 | 0.675 |
| 3018 | 0.673 |
| 3019 | 0.675 |
| 3020 | 0.673 |
| 3021 | 0.673 |
| 3022 | 0.673 |
| 3023 | 0.673 |
| 3024 | 0.673 |
| 3025 | 0.673 |
| 3026 | 0.67 |
| 3027 | 0.67 |
| 3028 | 0.67 |
| 3029 | 0.67 |
| 3030 | 0.67 |
| 3031 | 0.668 |
| 3032 | 0.668 |
| 3033 | 0.668 |
| 3034 | 0.668 |
| 3035 | 0.668 |
| 3036 | 0.668 |
| 3037 | 0.666 |
| 3038 | 0.666 |
| 3039 | 0.666 |
| 3040 | 0.668 |
| 3041 | 0.668 |
| 3042 | 0.666 |
| 3043 | 0.666 |
| 3044 | 0.666 |
| 3045 | 0.666 |
| 3046 | 0.663 |
| 3047 | 0.663 |
| 3048 | 0.666 |
| 3049 | 0.666 |
| 3050 | 0.666 |
| 3051 | 0.666 |
| 3052 | 0.666 |
| 3053 | 0.663 |
| 3054 | 0.666 |
| 3055 | 0.666 |
| 3056 | 0.666 |
| 3057 | 0.666 |
| 3058 | 0.666 |
| 3059 | 0.663 |
| 3060 | 0.666 |
| 3061 | 0.666 |
| 3062 | 0.666 |
| 3063 | 0.666 |
| 3064 | 0.666 |
| 3065 | 0.666 |
| 3066 | 0.666 |
| 3067 | 0.663 |
| 3068 | 0.666 |
| 3069 | 0.666 |
| 3070 | 0.666 |
| 3071 | 0.666 |
| 3072 | 0.666 |
| 3073 | 0.663 |
| 3074 | 0.663 |
| 3075 | 0.663 |
| 3076 | 0.663 |
| 3077 | 0.663 |
| 3078 | 0.663 |
| 3079 | 0.663 |
| 3080 | 0.663 |
| 3081 | 0.663 |
| 3082 | 0.663 |
| 3083 | 0.661 |
| 3084 | 0.663 |
| 3085 | 0.663 |
| 3086 | 0.663 |
| 3087 | 0.663 |
| 3088 | 0.661 |
| 3089 | 0.661 |
| 3090 | 0.661 |
| 3091 | 0.659 |
| 3092 | 0.661 |
| 3093 | 0.659 |
| 3094 | 0.661 |
| 3095 | 0.661 |
| 3096 | 0.659 |
| 3097 | 0.657 |
| 3098 | 0.657 |
| 3099 | 0.657 |
| 3100 | 0.657 |
| 3101 | 0.657 |
| 3102 | 0.657 |
| 3103 | 0.654 |
| 3104 | 0.657 |
| 3105 | 0.654 |
| 3106 | 0.654 |
| 3107 | 0.657 |
| 3108 | 0.654 |
| 3109 | 0.654 |
| 3110 | 0.657 |
| 3111 | 0.654 |
| 3112 | 0.657 |
| 3113 | 0.654 |
| 3114 | 0.657 |
| 3115 | 0.657 |
| 3116 | 0.657 |
| 3117 | 0.654 |
| 3118 | 0.654 |
| 3119 | 0.654 |
| 3120 | 0.654 |
| 3121 | 0.657 |
| 3122 | 0.654 |
| 3123 | 0.654 |
| 3124 | 0.654 |
| 3125 | 0.652 |
| 3126 | 0.652 |
| 3127 | 0.652 |
| 3128 | 0.65 |
| 3129 | 0.65 |
| 3130 | 0.65 |
| 3131 | 0.65 |
| 3132 | 0.647 |
| 3133 | 0.645 |
| 3134 | 0.645 |
| 3135 | 0.645 |
| 3136 | 0.643 |
| 3137 | 0.643 |
| 3138 | 0.643 |
| 3139 | 0.643 |
| 3140 | 0.641 |
| 3141 | 0.641 |
| 3142 | 0.638 |
| 3143 | 0.636 |
| 3144 | 0.636 |
| 3145 | 0.636 |
| 3146 | 0.636 |
| 3147 | 0.634 |
| 3148 | 0.634 |
| 3149 | 0.634 |
| 3150 | 0.631 |
| 3151 | 0.631 |
| 3152 | 0.627 |
| 3153 | 0.629 |
| 3154 | 0.627 |
| 3155 | 0.625 |
| 3156 | 0.625 |
| 3157 | 0.625 |
| 3158 | 0.62 |
| 3159 | 0.622 |
| 3160 | 0.62 |
| 3161 | 0.62 |
| 3162 | 0.618 |
| 3163 | 0.618 |
| 3164 | 0.615 |
| 3165 | 0.615 |
| 3166 | 0.615 |
| 3167 | 0.613 |
| 3168 | 0.613 |
| 3169 | 0.611 |
| 3170 | 0.613 |
| 3171 | 0.611 |
| 3172 | 0.611 |
| 3173 | 0.611 |
| 3174 | 0.611 |
| 3175 | 0.609 |
| 3176 | 0.611 |
| 3177 | 0.609 |
| 3178 | 0.609 |
| 3179 | 0.609 |
| 3180 | 0.606 |
| 3181 | 0.609 |
| 3182 | 0.606 |
| 3183 | 0.604 |
| 3184 | 0.606 |
| 3185 | 0.604 |
| 3186 | 0.604 |
| 3187 | 0.602 |
| 3188 | 0.602 |
| 3189 | 0.602 |
| 3190 | 0.599 |
| 3191 | 0.602 |
| 3192 | 0.599 |
| 3193 | 0.599 |
| 3194 | 0.599 |
| 3195 | 0.599 |
| 3196 | 0.599 |
| 3197 | 0.597 |
| 3198 | 0.597 |
| 3199 | 0.597 |
| 3200 | 0.597 |
| 3201 | 0.595 |
| 3202 | 0.597 |
| 3203 | 0.595 |
| 3204 | 0.595 |
| 3205 | 0.595 |
| 3206 | 0.595 |
| 3207 | 0.593 |
| 3208 | 0.593 |
| 3209 | 0.593 |
| 3210 | 0.593 |
| 3211 | 0.588 |
| 3212 | 0.59 |
| 3213 | 0.59 |
| 3214 | 0.59 |
| 3215 | 0.59 |
| 3216 | 0.59 |
| 3217 | 0.59 |
| 3218 | 0.59 |
| 3219 | 0.59 |
| 3220 | 0.588 |
| 3221 | 0.59 |
| 3222 | 0.588 |
| 3223 | 0.59 |
| 3224 | 0.588 |
| 3225 | 0.588 |
| 3226 | 0.588 |
| 3227 | 0.588 |
| 3228 | 0.59 |
| 3229 | 0.588 |
| 3230 | 0.59 |
| 3231 | 0.59 |
| 3232 | 0.59 |
| 3233 | 0.59 |
| 3234 | 0.59 |
| 3235 | 0.593 |
| 3236 | 0.59 |
| 3237 | 0.593 |
| 3238 | 0.593 |
| 3239 | 0.59 |
| 3240 | 0.593 |
| 3241 | 0.593 |
| 3242 | 0.59 |
| 3243 | 0.59 |
| 3244 | 0.59 |
| 3245 | 0.59 |
| 3246 | 0.59 |
| 3247 | 0.588 |
| 3248 | 0.588 |
| 3249 | 0.588 |
| 3250 | 0.588 |
| 3251 | 0.588 |
| 3252 | 0.588 |
| 3253 | 0.586 |
| 3254 | 0.586 |
| 3255 | 0.586 |
| 3256 | 0.583 |
| 3257 | 0.583 |
| 3258 | 0.581 |
| 3259 | 0.586 |
| 3260 | 0.581 |
| 3261 | 0.581 |
| 3262 | 0.579 |
| 3263 | 0.581 |
| 3264 | 0.579 |
| 3265 | 0.579 |
| 3266 | 0.577 |
| 3267 | 0.577 |
| 3268 | 0.577 |
| 3269 | 0.574 |
| 3270 | 0.574 |
| 3271 | 0.572 |
| 3272 | 0.572 |
| 3273 | 0.572 |
| 3274 | 0.572 |
| 3275 | 0.57 |
| 3276 | 0.57 |
| 3277 | 0.57 |
| 3278 | 0.567 |
| 3279 | 0.567 |
| 3280 | 0.565 |
| 3281 | 0.565 |
| 3282 | 0.563 |
| 3283 | 0.563 |
| 3284 | 0.563 |
| 3285 | 0.56 |
| 3286 | 0.56 |
| 3287 | 0.56 |
| 3288 | 0.558 |
| 3289 | 0.558 |
| 3290 | 0.558 |
| 3291 | 0.558 |
| 3292 | 0.556 |
| 3293 | 0.556 |
| 3294 | 0.556 |
| 3295 | 0.556 |
| 3296 | 0.556 |
| 3297 | 0.556 |
| 3298 | 0.554 |
| 3299 | 0.556 |
| 3300 | 0.554 |
| 3301 | 0.554 |
| 3302 | 0.554 |
| 3303 | 0.554 |
| 3304 | 0.554 |
| 3305 | 0.554 |
| 3306 | 0.554 |
| 3307 | 0.554 |
| 3308 | 0.554 |
| 3309 | 0.554 |
| 3310 | 0.554 |
| 3311 | 0.551 |
| 3312 | 0.551 |
| 3313 | 0.549 |
| 3314 | 0.549 |
| 3315 | 0.549 |
| 3316 | 0.549 |
| 3317 | 0.549 |
| 3318 | 0.549 |
| 3319 | 0.549 |
| 3320 | 0.547 |
| 3321 | 0.547 |
| 3322 | 0.544 |
| 3323 | 0.547 |
| 3324 | 0.544 |
| 3325 | 0.542 |
| 3326 | 0.542 |
| 3327 | 0.542 |
| 3328 | 0.542 |
| 3329 | 0.542 |
| 3330 | 0.542 |
| 3331 | 0.538 |
| 3332 | 0.54 |
| 3333 | 0.54 |
| 3334 | 0.538 |
| 3335 | 0.538 |
| 3336 | 0.538 |
| 3337 | 0.538 |
| 3338 | 0.538 |
| 3339 | 0.535 |
| 3340 | 0.535 |
| 3341 | 0.535 |
| 3342 | 0.535 |
| 3343 | 0.535 |
| 3344 | 0.533 |
| 3345 | 0.533 |
| 3346 | 0.533 |
| 3347 | 0.531 |
| 3348 | 0.531 |
| 3349 | 0.531 |
| 3350 | 0.531 |
| 3351 | 0.531 |
| 3352 | 0.528 |
| 3353 | 0.528 |
| 3354 | 0.528 |
| 3355 | 0.526 |
| 3356 | 0.526 |
| 3357 | 0.526 |
| 3358 | 0.526 |
| 3359 | 0.524 |
| 3360 | 0.524 |
| 3361 | 0.526 |
| 3362 | 0.526 |
| 3363 | 0.524 |
| 3364 | 0.524 |
| 3365 | 0.524 |
| 3366 | 0.522 |
| 3367 | 0.522 |
| 3368 | 0.524 |
| 3369 | 0.522 |
| 3370 | 0.522 |
| 3371 | 0.519 |
| 3372 | 0.519 |
| 3373 | 0.522 |
| 3374 | 0.519 |
| 3375 | 0.519 |
| 3376 | 0.519 |
| 3377 | 0.517 |
| 3378 | 0.517 |
| 3379 | 0.519 |
| 3380 | 0.517 |
| 3381 | 0.515 |
| 3382 | 0.517 |
| 3383 | 0.515 |
| 3384 | 0.515 |
| 3385 | 0.515 |
| 3386 | 0.512 |
| 3387 | 0.512 |
| 3388 | 0.512 |
| 3389 | 0.51 |
| 3390 | 0.51 |
| 3391 | 0.508 |
| 3392 | 0.51 |
| 3393 | 0.508 |
| 3394 | 0.508 |
| 3395 | 0.506 |
| 3396 | 0.506 |
| 3397 | 0.506 |
| 3398 | 0.503 |
| 3399 | 0.501 |
| 3400 | 0.503 |
| 3401 | 0.501 |
| 3402 | 0.499 |
| 3403 | 0.499 |
| 3404 | 0.499 |
| 3405 | 0.496 |
| 3406 | 0.494 |
| 3407 | 0.496 |
| 3408 | 0.494 |
| 3409 | 0.492 |
| 3410 | 0.492 |
| 3411 | 0.49 |
| 3412 | 0.49 |
| 3413 | 0.487 |
| 3414 | 0.487 |
| 3415 | 0.485 |
| 3416 | 0.485 |
| 3417 | 0.485 |
| 3418 | 0.483 |
| 3419 | 0.483 |
| 3420 | 0.48 |
| 3421 | 0.478 |
| 3422 | 0.478 |
| 3423 | 0.478 |
| 3424 | 0.476 |
| 3425 | 0.476 |
| 3426 | 0.474 |
| 3427 | 0.474 |
| 3428 | 0.471 |
| 3429 | 0.471 |
| 3430 | 0.469 |
| 3431 | 0.471 |
| 3432 | 0.469 |
| 3433 | 0.467 |
| 3434 | 0.467 |
| 3435 | 0.467 |
| 3436 | 0.464 |
| 3437 | 0.464 |
| 3438 | 0.462 |
| 3439 | 0.464 |
| 3440 | 0.462 |
| 3441 | 0.462 |
| 3442 | 0.46 |
| 3443 | 0.46 |
| 3444 | 0.46 |
| 3445 | 0.458 |
| 3446 | 0.458 |
| 3447 | 0.458 |
| 3448 | 0.455 |
| 3449 | 0.455 |
| 3450 | 0.458 |
| 3451 | 0.455 |
| 3452 | 0.455 |
| 3453 | 0.455 |
| 3454 | 0.455 |
| 3455 | 0.453 |
| 3456 | 0.453 |
| 3457 | 0.453 |
| 3458 | 0.451 |
| 3459 | 0.451 |
| 3460 | 0.451 |
| 3461 | 0.451 |
| 3462 | 0.451 |
| 3463 | 0.448 |
| 3464 | 0.446 |
| 3465 | 0.446 |
| 3466 | 0.448 |
| 3467 | 0.446 |
| 3468 | 0.446 |
| 3469 | 0.446 |
| 3470 | 0.446 |
| 3471 | 0.444 |
| 3472 | 0.444 |
| 3473 | 0.444 |
| 3474 | 0.444 |
| 3475 | 0.442 |
| 3476 | 0.442 |
| 3477 | 0.442 |
| 3478 | 0.442 |
| 3479 | 0.439 |
| 3480 | 0.439 |
| 3481 | 0.437 |
| 3482 | 0.437 |
| 3483 | 0.437 |
| 3484 | 0.437 |
| 3485 | 0.437 |
| 3486 | 0.437 |
| 3487 | 0.432 |
| 3488 | 0.432 |
| 3489 | 0.432 |
| 3490 | 0.432 |
| 3491 | 0.432 |
| 3492 | 0.43 |
| 3493 | 0.43 |
| 3494 | 0.43 |
| 3495 | 0.43 |
| 3496 | 0.43 |
| 3497 | 0.428 |
| 3498 | 0.426 |
| 3499 | 0.426 |
| 3500 | 0.426 |
| 3501 | 0.423 |
| 3502 | 0.423 |
| 3503 | 0.423 |
| 3504 | 0.423 |
| 3505 | 0.421 |
| 3506 | 0.421 |
| 3507 | 0.421 |
| 3508 | 0.419 |
| 3509 | 0.419 |
| 3510 | 0.419 |
| 3511 | 0.421 |
| 3512 | 0.419 |
| 3513 | 0.419 |
| 3514 | 0.416 |
| 3515 | 0.414 |
| 3516 | 0.416 |
| 3517 | 0.416 |
| 3518 | 0.414 |
| 3519 | 0.414 |
| 3520 | 0.414 |
| 3521 | 0.412 |
| 3522 | 0.412 |
| 3523 | 0.412 |
| 3524 | 0.412 |
| 3525 | 0.412 |
| 3526 | 0.412 |
| 3527 | 0.412 |
| 3528 | 0.409 |
| 3529 | 0.412 |
| 3530 | 0.412 |
| 3531 | 0.409 |
| 3532 | 0.409 |
| 3533 | 0.407 |
| 3534 | 0.407 |
| 3535 | 0.407 |
| 3536 | 0.407 |
| 3537 | 0.405 |
| 3538 | 0.405 |
| 3539 | 0.405 |
| 3540 | 0.405 |
| 3541 | 0.403 |
| 3542 | 0.403 |
| 3543 | 0.4 |
| 3544 | 0.4 |
| 3545 | 0.4 |
| 3546 | 0.4 |
| 3547 | 0.398 |
| 3548 | 0.396 |
| 3549 | 0.398 |
| 3550 | 0.396 |
| 3551 | 0.396 |
| 3552 | 0.393 |
| 3553 | 0.396 |
| 3554 | 0.393 |
| 3555 | 0.391 |
| 3556 | 0.393 |
| 3557 | 0.391 |
| 3558 | 0.391 |
| 3559 | 0.389 |
| 3560 | 0.389 |
| 3561 | 0.389 |
| 3562 | 0.387 |
| 3563 | 0.389 |
| 3564 | 0.387 |
| 3565 | 0.384 |
| 3566 | 0.387 |
| 3567 | 0.384 |
| 3568 | 0.382 |
| 3569 | 0.384 |
| 3570 | 0.382 |
| 3571 | 0.382 |
| 3572 | 0.382 |
| 3573 | 0.38 |
| 3574 | 0.377 |
| 3575 | 0.377 |
| 3576 | 0.377 |
| 3577 | 0.375 |
| 3578 | 0.375 |
| 3579 | 0.373 |
| 3580 | 0.373 |
| 3581 | 0.375 |
| 3582 | 0.373 |
| 3583 | 0.373 |
| 3584 | 0.373 |
| 3585 | 0.373 |
| 3586 | 0.373 |
| 3587 | 0.371 |
| 3588 | 0.371 |
| 3589 | 0.373 |
| 3590 | 0.371 |
| 3591 | 0.371 |
| 3592 | 0.371 |
| 3593 | 0.371 |
| 3594 | 0.371 |
| 3595 | 0.371 |
| 3596 | 0.371 |
| 3597 | 0.368 |
| 3598 | 0.371 |
| 3599 | 0.368 |
| 3600 | 0.368 |
| 3601 | 0.368 |
| 3602 | 0.368 |
| 3603 | 0.371 |
| 3604 | 0.368 |
| 3605 | 0.368 |
| 3606 | 0.366 |
| 3607 | 0.368 |
| 3608 | 0.368 |
| 3609 | 0.366 |
| 3610 | 0.366 |
| 3611 | 0.366 |
| 3612 | 0.366 |
| 3613 | 0.368 |
| 3614 | 0.366 |
| 3615 | 0.366 |
| 3616 | 0.366 |
| 3617 | 0.366 |
| 3618 | 0.366 |
| 3619 | 0.364 |
| 3620 | 0.366 |
| 3621 | 0.366 |
| 3622 | 0.366 |
| 3623 | 0.364 |
| 3624 | 0.366 |
| 3625 | 0.366 |
| 3626 | 0.364 |
| 3627 | 0.366 |
| 3628 | 0.366 |
| 3629 | 0.364 |
| 3630 | 0.364 |
| 3631 | 0.366 |
| 3632 | 0.364 |
| 3633 | 0.364 |
| 3634 | 0.364 |
| 3635 | 0.364 |
| 3636 | 0.364 |
| 3637 | 0.361 |
| 3638 | 0.364 |
| 3639 | 0.364 |
| 3640 | 0.361 |
| 3641 | 0.364 |
| 3642 | 0.361 |
| 3643 | 0.364 |
| 3644 | 0.364 |
| 3645 | 0.364 |
| 3646 | 0.361 |
| 3647 | 0.361 |
| 3648 | 0.364 |
| 3649 | 0.361 |
| 3650 | 0.361 |
| 3651 | 0.361 |
| 3652 | 0.361 |
| 3653 | 0.361 |
| 3654 | 0.361 |
| 3655 | 0.359 |
| 3656 | 0.359 |
| 3657 | 0.359 |
| 3658 | 0.361 |
| 3659 | 0.359 |
| 3660 | 0.359 |
| 3661 | 0.357 |
| 3662 | 0.357 |
| 3663 | 0.357 |
| 3664 | 0.357 |
| 3665 | 0.355 |
| 3666 | 0.357 |
| 3667 | 0.357 |
| 3668 | 0.355 |
| 3669 | 0.355 |
| 3670 | 0.355 |
| 3671 | 0.355 |
| 3672 | 0.352 |
| 3673 | 0.352 |
| 3674 | 0.355 |
| 3675 | 0.35 |
| 3676 | 0.35 |
| 3677 | 0.35 |
| 3678 | 0.352 |
| 3679 | 0.35 |
| 3680 | 0.35 |
| 3681 | 0.35 |
| 3682 | 0.348 |
| 3683 | 0.348 |
| 3684 | 0.348 |
| 3685 | 0.348 |
| 3686 | 0.345 |
| 3687 | 0.345 |
| 3688 | 0.345 |
| 3689 | 0.343 |
| 3690 | 0.343 |
| 3691 | 0.341 |
| 3692 | 0.341 |
| 3693 | 0.339 |
| 3694 | 0.341 |
| 3695 | 0.341 |
| 3696 | 0.336 |
| 3697 | 0.336 |
| 3698 | 0.339 |
| 3699 | 0.336 |
| 3700 | 0.334 |
| 3701 | 0.334 |
| 3702 | 0.334 |
| 3703 | 0.334 |
| 3704 | 0.334 |
| 3705 | 0.334 |
| 3706 | 0.332 |
| 3707 | 0.332 |
| 3708 | 0.332 |
| 3709 | 0.332 |
| 3710 | 0.332 |
| 3711 | 0.332 |
| 3712 | 0.332 |
| 3713 | 0.332 |
| 3714 | 0.329 |
| 3715 | 0.329 |
| 3716 | 0.327 |
| 3717 | 0.327 |
| 3718 | 0.327 |
| 3719 | 0.327 |
| 3720 | 0.327 |
| 3721 | 0.327 |
| 3722 | 0.325 |
| 3723 | 0.327 |
| 3724 | 0.327 |
| 3725 | 0.325 |
| 3726 | 0.323 |
| 3727 | 0.323 |
| 3728 | 0.323 |
| 3729 | 0.323 |
| 3730 | 0.323 |
| 3731 | 0.323 |
| 3732 | 0.323 |
| 3733 | 0.323 |
| 3734 | 0.323 |
| 3735 | 0.323 |
| 3736 | 0.323 |
| 3737 | 0.32 |
| 3738 | 0.32 |
| 3739 | 0.323 |
| 3740 | 0.32 |
| 3741 | 0.323 |
| 3742 | 0.32 |
| 3743 | 0.32 |
| 3744 | 0.323 |
| 3745 | 0.323 |
| 3746 | 0.318 |
| 3747 | 0.32 |
| 3748 | 0.32 |
| 3749 | 0.32 |
| 3750 | 0.32 |
| 3751 | 0.32 |
| 3752 | 0.32 |
| 3753 | 0.32 |
| 3754 | 0.32 |
| 3755 | 0.32 |
| 3756 | 0.318 |
| 3757 | 0.318 |
| 3758 | 0.318 |
| 3759 | 0.316 |
| 3760 | 0.316 |
| 3761 | 0.316 |
| 3762 | 0.316 |
| 3763 | 0.316 |
| 3764 | 0.316 |
| 3765 | 0.316 |
| 3766 | 0.316 |
| 3767 | 0.316 |
| 3768 | 0.313 |
| 3769 | 0.313 |
| 3770 | 0.313 |
| 3771 | 0.313 |
| 3772 | 0.311 |
| 3773 | 0.313 |
| 3774 | 0.313 |
| 3775 | 0.311 |
| 3776 | 0.311 |
| 3777 | 0.311 |
| 3778 | 0.309 |
| 3779 | 0.309 |
| 3780 | 0.309 |
| 3781 | 0.307 |
| 3782 | 0.307 |
| 3783 | 0.307 |
| 3784 | 0.304 |
| 3785 | 0.307 |
| 3786 | 0.307 |
| 3787 | 0.304 |
| 3788 | 0.304 |
| 3789 | 0.304 |
| 3790 | 0.302 |
| 3791 | 0.302 |
| 3792 | 0.3 |
| 3793 | 0.3 |
| 3794 | 0.302 |
| 3795 | 0.297 |
| 3796 | 0.3 |
| 3797 | 0.297 |
| 3798 | 0.297 |
| 3799 | 0.297 |
| 3800 | 0.295 |
| 3801 | 0.295 |
| 3802 | 0.293 |
| 3803 | 0.293 |
| 3804 | 0.293 |
| 3805 | 0.293 |
| 3806 | 0.293 |
| 3807 | 0.293 |
| 3808 | 0.293 |
| 3809 | 0.291 |
| 3810 | 0.291 |
| 3811 | 0.291 |
| 3812 | 0.291 |
| 3813 | 0.291 |
| 3814 | 0.288 |
| 3815 | 0.288 |
| 3816 | 0.288 |
| 3817 | 0.288 |
| 3818 | 0.286 |
| 3819 | 0.286 |
| 3820 | 0.286 |
| 3821 | 0.286 |
| 3822 | 0.284 |
| 3823 | 0.286 |
| 3824 | 0.284 |
| 3825 | 0.284 |
| 3826 | 0.284 |
| 3827 | 0.284 |
| 3828 | 0.281 |
| 3829 | 0.281 |
| 3830 | 0.281 |
| 3831 | 0.279 |
| 3832 | 0.281 |
| 3833 | 0.279 |
| 3834 | 0.279 |
| 3835 | 0.277 |
| 3836 | 0.277 |
| 3837 | 0.277 |
| 3838 | 0.277 |
| 3839 | 0.277 |
| 3840 | 0.277 |
| 3841 | 0.275 |
| 3842 | 0.275 |
| 3843 | 0.277 |
| 3844 | 0.275 |
| 3845 | 0.275 |
| 3846 | 0.275 |
| 3847 | 0.272 |
| 3848 | 0.272 |
| 3849 | 0.272 |
| 3850 | 0.272 |
| 3851 | 0.272 |
| 3852 | 0.272 |
| 3853 | 0.27 |
| 3854 | 0.27 |
| 3855 | 0.27 |
| 3856 | 0.268 |
| 3857 | 0.27 |
| 3858 | 0.268 |
| 3859 | 0.268 |
| 3860 | 0.268 |
| 3861 | 0.265 |
| 3862 | 0.268 |
| 3863 | 0.265 |
| 3864 | 0.265 |
| 3865 | 0.265 |
| 3866 | 0.265 |
| 3867 | 0.265 |
| 3868 | 0.263 |
| 3869 | 0.263 |
| 3870 | 0.263 |
| 3871 | 0.263 |
| 3872 | 0.263 |
| 3873 | 0.261 |
| 3874 | 0.261 |
| 3875 | 0.261 |
| 3876 | 0.261 |
| 3877 | 0.261 |
| 3878 | 0.261 |
| 3879 | 0.261 |
| 3880 | 0.259 |
| 3881 | 0.261 |
| 3882 | 0.259 |
| 3883 | 0.261 |
| 3884 | 0.261 |
| 3885 | 0.259 |
| 3886 | 0.259 |
| 3887 | 0.259 |
| 3888 | 0.259 |
| 3889 | 0.259 |
| 3890 | 0.259 |
| 3891 | 0.256 |
| 3892 | 0.256 |
| 3893 | 0.259 |
| 3894 | 0.256 |
| 3895 | 0.256 |
| 3896 | 0.259 |
| 3897 | 0.256 |
| 3898 | 0.256 |
| 3899 | 0.256 |
| 3900 | 0.256 |
| 3901 | 0.256 |
| 3902 | 0.254 |
| 3903 | 0.256 |
| 3904 | 0.256 |
| 3905 | 0.254 |
| 3906 | 0.254 |
| 3907 | 0.254 |
| 3908 | 0.254 |
| 3909 | 0.254 |
| 3910 | 0.252 |
| 3911 | 0.252 |
| 3912 | 0.254 |
| 3913 | 0.252 |
| 3914 | 0.252 |
| 3915 | 0.249 |
| 3916 | 0.252 |
| 3917 | 0.249 |
| 3918 | 0.252 |
| 3919 | 0.249 |
| 3920 | 0.249 |
| 3921 | 0.249 |
| 3922 | 0.249 |
| 3923 | 0.249 |
| 3924 | 0.249 |
| 3925 | 0.249 |
| 3926 | 0.247 |
| 3927 | 0.247 |
| 3928 | 0.247 |
| 3929 | 0.245 |
| 3930 | 0.245 |
| 3931 | 0.245 |
| 3932 | 0.245 |
| 3933 | 0.245 |
| 3934 | 0.245 |
| 3935 | 0.242 |
| 3936 | 0.242 |
| 3937 | 0.242 |
| 3938 | 0.24 |
| 3939 | 0.24 |
| 3940 | 0.24 |
| 3941 | 0.238 |
| 3942 | 0.238 |
| 3943 | 0.238 |
| 3944 | 0.236 |
| 3945 | 0.236 |
| 3946 | 0.236 |
| 3947 | 0.236 |
| 3948 | 0.233 |
| 3949 | 0.233 |
| 3950 | 0.233 |
| 3951 | 0.231 |
| 3952 | 0.231 |
| 3953 | 0.231 |
| 3954 | 0.231 |
| 3955 | 0.229 |
| 3956 | 0.229 |
| 3957 | 0.229 |
| 3958 | 0.229 |
| 3959 | 0.229 |
| 3960 | 0.224 |
| 3961 | 0.224 |
| 3962 | 0.224 |
| 3963 | 0.226 |
| 3964 | 0.224 |
| 3965 | 0.224 |
| 3966 | 0.222 |
| 3967 | 0.222 |
| 3968 | 0.222 |
| 3969 | 0.222 |
| 3970 | 0.222 |
| 3971 | 0.22 |
| 3972 | 0.217 |
| 3973 | 0.217 |
| 3974 | 0.217 |
| 3975 | 0.217 |
| 3976 | 0.217 |
| 3977 | 0.217 |
| 3978 | 0.215 |
| 3979 | 0.213 |
| 3980 | 0.213 |
| 3981 | 0.213 |
| 3982 | 0.213 |
| 3983 | 0.213 |
| 3984 | 0.21 |
| 3985 | 0.21 |
| 3986 | 0.21 |
| 3987 | 0.21 |
| 3988 | 0.21 |
| 3989 | 0.208 |
| 3990 | 0.208 |
| 3991 | 0.208 |
| 3992 | 0.208 |
| 3993 | 0.206 |
| 3994 | 0.206 |
| 3995 | 0.204 |
| 3996 | 0.206 |
| 3997 | 0.204 |
| 3998 | 0.204 |
| 3999 | 0.204 |
| 4000 | 0.204 |
| 4001 | 0.201 |
| 4002 | 0.201 |
| 4003 | 0.201 |
| 4004 | 0.201 |
| 4005 | 0.199 |
| 4006 | 0.199 |
| 4007 | 0.199 |
| 4008 | 0.201 |
| 4009 | 0.199 |
| 4010 | 0.199 |
| 4011 | 0.197 |
| 4012 | 0.197 |
| 4013 | 0.197 |
| 4014 | 0.197 |
| 4015 | 0.197 |
| 4016 | 0.194 |
| 4017 | 0.194 |
| 4018 | 0.194 |
| 4019 | 0.194 |
| 4020 | 0.194 |
| 4021 | 0.194 |
| 4022 | 0.192 |
| 4023 | 0.192 |
| 4024 | 0.192 |
| 4025 | 0.19 |
| 4026 | 0.192 |
| 4027 | 0.192 |
| 4028 | 0.19 |
| 4029 | 0.19 |
| 4030 | 0.188 |
| 4031 | 0.188 |
| 4032 | 0.19 |
| 4033 | 0.188 |
| 4034 | 0.188 |
| 4035 | 0.188 |
| 4036 | 0.185 |
| 4037 | 0.188 |
| 4038 | 0.185 |
| 4039 | 0.185 |
| 4040 | 0.185 |
| 4041 | 0.185 |
| 4042 | 0.185 |
| 4043 | 0.185 |
| 4044 | 0.183 |
| 4045 | 0.185 |
| 4046 | 0.183 |
| 4047 | 0.183 |
| 4048 | 0.181 |
| 4049 | 0.183 |
| 4050 | 0.183 |
| 4051 | 0.181 |
| 4052 | 0.181 |
| 4053 | 0.181 |
| 4054 | 0.181 |
| 4055 | 0.178 |
| 4056 | 0.178 |
| 4057 | 0.178 |
| 4058 | 0.178 |
| 4059 | 0.178 |
| 4060 | 0.178 |
| 4061 | 0.178 |
| 4062 | 0.176 |
| 4063 | 0.176 |
| 4064 | 0.176 |
| 4065 | 0.176 |
| 4066 | 0.174 |
| 4067 | 0.174 |
| 4068 | 0.174 |
| 4069 | 0.174 |
| 4070 | 0.174 |
| 4071 | 0.174 |
| 4072 | 0.172 |
| 4073 | 0.174 |
| 4074 | 0.172 |
| 4075 | 0.172 |
| 4076 | 0.172 |
| 4077 | 0.169 |
| 4078 | 0.172 |
| 4079 | 0.169 |
| 4080 | 0.167 |
| 4081 | 0.169 |
| 4082 | 0.167 |
| 4083 | 0.167 |
| 4084 | 0.167 |
| 4085 | 0.165 |
| 4086 | 0.167 |
| 4087 | 0.165 |
| 4088 | 0.162 |
| 4089 | 0.165 |
| 4090 | 0.162 |
| 4091 | 0.162 |
| 4092 | 0.162 |
| 4093 | 0.16 |
| 4094 | 0.162 |
| 4095 | 0.16 |
| 4096 | 0.16 |
| 4097 | 0.16 |
| 4098 | 0.158 |
| 4099 | 0.158 |
| 4100 | 0.158 |
| 4101 | 0.158 |
| 4102 | 0.156 |
| 4103 | 0.156 |
| 4104 | 0.156 |
| 4105 | 0.156 |
| 4106 | 0.153 |
| 4107 | 0.153 |
| 4108 | 0.153 |
| 4109 | 0.151 |
| 4110 | 0.153 |
| 4111 | 0.151 |
| 4112 | 0.151 |
| 4113 | 0.149 |
| 4114 | 0.151 |
| 4115 | 0.149 |
| 4116 | 0.149 |
| 4117 | 0.146 |
| 4118 | 0.149 |
| 4119 | 0.146 |
| 4120 | 0.146 |
| 4121 | 0.144 |
| 4122 | 0.146 |
| 4123 | 0.144 |
| 4124 | 0.144 |
| 4125 | 0.144 |
| 4126 | 0.142 |
| 4127 | 0.144 |
| 4128 | 0.144 |
| 4129 | 0.142 |
| 4130 | 0.142 |
| 4131 | 0.142 |
| 4132 | 0.142 |
| 4133 | 0.142 |
| 4134 | 0.14 |
| 4135 | 0.14 |
| 4136 | 0.142 |
| 4137 | 0.14 |
| 4138 | 0.14 |
| 4139 | 0.137 |
| 4140 | 0.137 |
| 4141 | 0.14 |
| 4142 | 0.137 |
| 4143 | 0.137 |
| 4144 | 0.137 |
| 4145 | 0.135 |
| 4146 | 0.135 |
| 4147 | 0.137 |
| 4148 | 0.135 |
| 4149 | 0.135 |
| 4150 | 0.135 |
| 4151 | 0.135 |
| 4152 | 0.133 |
| 4153 | 0.133 |
| 4154 | 0.135 |
| 4155 | 0.133 |
| 4156 | 0.133 |
| 4157 | 0.133 |
| 4158 | 0.13 |
| 4159 | 0.13 |
| 4160 | 0.13 |
| 4161 | 0.13 |
| 4162 | 0.128 |
| 4163 | 0.13 |
| 4164 | 0.13 |
| 4165 | 0.13 |
| 4166 | 0.128 |
| 4167 | 0.128 |
| 4168 | 0.128 |
| 4169 | 0.128 |
| 4170 | 0.126 |
| 4171 | 0.126 |
| 4172 | 0.126 |
| 4173 | 0.126 |
| 4174 | 0.126 |
| 4175 | 0.124 |
| 4176 | 0.124 |
| 4177 | 0.124 |
| 4178 | 0.124 |
| 4179 | 0.121 |
| 4180 | 0.121 |
| 4181 | 0.121 |
| 4182 | 0.121 |
| 4183 | 0.121 |
| 4184 | 0.119 |
| 4185 | 0.119 |
| 4186 | 0.119 |
| 4187 | 0.121 |
| 4188 | 0.119 |
| 4189 | 0.117 |
| 4190 | 0.117 |
| 4191 | 0.117 |
| 4192 | 0.117 |
| 4193 | 0.117 |
| 4194 | 0.117 |
| 4195 | 0.114 |
| 4196 | 0.114 |
| 4197 | 0.114 |
| 4198 | 0.114 |
| 4199 | 0.114 |
| 4200 | 0.114 |
| 4201 | 0.114 |
| 4202 | 0.112 |
| 4203 | 0.112 |
| 4204 | 0.112 |
| 4205 | 0.112 |
| 4206 | 0.112 |
| 4207 | 0.112 |
| 4208 | 0.112 |
| 4209 | 0.112 |
| 4210 | 0.112 |
| 4211 | 0.11 |
| 4212 | 0.108 |
| 4213 | 0.108 |
| 4214 | 0.108 |
| 4215 | 0.108 |
| 4216 | 0.108 |
| 4217 | 0.108 |
| 4218 | 0.108 |
| 4219 | 0.108 |
| 4220 | 0.108 |
| 4221 | 0.108 |
| 4222 | 0.108 |
| 4223 | 0.105 |
| 4224 | 0.105 |
| 4225 | 0.105 |
| 4226 | 0.105 |
| 4227 | 0.105 |
| 4228 | 0.105 |
| 4229 | 0.105 |
| 4230 | 0.105 |
| 4231 | 0.105 |
| 4232 | 0.103 |
| 4233 | 0.103 |
| 4234 | 0.103 |
| 4235 | 0.101 |
| 4236 | 0.103 |
| 4237 | 0.103 |
| 4238 | 0.103 |
| 4239 | 0.101 |
| 4240 | 0.101 |
| 4241 | 0.101 |
| 4242 | 0.101 |
| 4243 | 0.101 |
| 4244 | 0.101 |
| 4245 | 0.101 |
| 4246 | 0.098 |
| 4247 | 0.098 |
| 4248 | 0.098 |
| 4249 | 0.098 |
| 4250 | 0.098 |
| 4251 | 0.098 |
| 4252 | 0.096 |
| 4253 | 0.096 |
| 4254 | 0.096 |
| 4255 | 0.096 |
| 4256 | 0.096 |
| 4257 | 0.094 |
| 4258 | 0.094 |
| 4259 | 0.094 |
| 4260 | 0.096 |
| 4261 | 0.096 |
| 4262 | 0.094 |
| 4263 | 0.094 |
| 4264 | 0.094 |
| 4265 | 0.094 |
| 4266 | 0.092 |
| 4267 | 0.092 |
| 4268 | 0.092 |
| 4269 | 0.092 |
| 4270 | 0.089 |
| 4271 | 0.092 |
| 4272 | 0.092 |
| 4273 | 0.092 |
| 4274 | 0.089 |
| 4275 | 0.089 |
| 4276 | 0.089 |
| 4277 | 0.089 |
| 4278 | 0.087 |
| 4279 | 0.087 |
| 4280 | 0.089 |